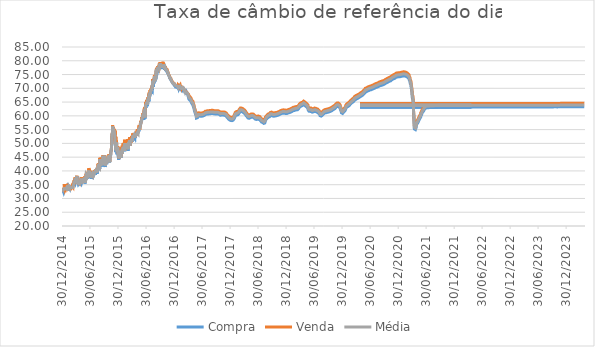
| Category | Compra | Venda | Média |
|---|---|---|---|
| 30/12/2014 | 33.41 | 33.81 | 33.61 |
| 31/12/2014 | 33.31 | 33.89 | 33.6 |
| 05/01/2015 | 33.19 | 33.45 | 33.32 |
| 06/01/2015 | 32.77 | 33.23 | 33 |
| 07/01/2015 | 32.99 | 33.15 | 33.07 |
| 08/01/2015 | 32.46 | 32.88 | 32.67 |
| 09/01/2015 | 32.31 | 33.02 | 32.67 |
| 12/01/2015 | 32.96 | 33.22 | 33.09 |
| 13/01/2015 | 33.39 | 33.78 | 33.59 |
| 14/01/2015 | 32.78 | 35.18 | 33.98 |
| 16/01/2015 | 33.11 | 33.54 | 33.33 |
| 19/01/2015 | 33.41 | 33.64 | 33.52 |
| 20/01/2015 | 33.86 | 34.04 | 33.95 |
| 21/01/2015 | 32.98 | 33.25 | 33.12 |
| 22/01/2015 | 33.01 | 33.4 | 33.21 |
| 23/01/2015 | 33.19 | 33.28 | 33.24 |
| 26/01/2015 | 33.58 | 33.79 | 33.69 |
| 27/01/2015 | 33.5 | 33.66 | 33.58 |
| 28/01/2015 | 33.8 | 34.09 | 33.94 |
| 29/01/2015 | 33.92 | 34.14 | 34.03 |
| 30/01/2015 | 34.05 | 34.41 | 34.23 |
| 02/02/2015 | 32.72 | 33.1 | 32.91 |
| 04/02/2015 | 34.33 | 35.3 | 34.82 |
| 05/02/2015 | 33.66 | 33.86 | 33.76 |
| 06/02/2015 | 33.56 | 34.07 | 33.82 |
| 09/02/2015 | 33.75 | 34.24 | 34 |
| 10/02/2015 | 34 | 34.16 | 34.08 |
| 11/02/2015 | 33.92 | 34.23 | 34.07 |
| 12/02/2015 | 33.47 | 34.16 | 33.82 |
| 13/02/2015 | 34.04 | 34.42 | 34.23 |
| 16/02/2015 | 34.07 | 34.35 | 34.21 |
| 17/02/2015 | 33.65 | 34.03 | 33.84 |
| 18/02/2015 | 34.13 | 34.38 | 34.26 |
| 19/02/2015 | 33.99 | 34.31 | 34.15 |
| 20/02/2015 | 33.86 | 34.08 | 33.97 |
| 23/02/2015 | 33.84 | 34.06 | 33.95 |
| 24/02/2015 | 33.92 | 34.16 | 34.04 |
| 25/02/2015 | 33.73 | 34.03 | 33.88 |
| 26/02/2015 | 33.79 | 34.07 | 33.93 |
| 27/02/2015 | 33.54 | 33.63 | 33.59 |
| 02/03/2015 | 33.59 | 33.95 | 33.77 |
| 03/03/2015 | 33.45 | 33.7 | 33.58 |
| 04/03/2015 | 33.99 | 34.03 | 34.01 |
| 05/03/2015 | 33.57 | 33.91 | 33.74 |
| 06/03/2015 | 34.19 | 34.52 | 34.36 |
| 09/03/2015 | 34.1 | 34.53 | 34.32 |
| 10/03/2015 | 33.95 | 34.41 | 34.18 |
| 11/03/2015 | 33.9 | 34.14 | 34.02 |
| 12/03/2015 | 34.52 | 34.81 | 34.66 |
| 13/03/2015 | 34.77 | 35.22 | 34.99 |
| 16/03/2015 | 34.54 | 35.8 | 35.17 |
| 17/03/2015 | 34.73 | 36 | 35.37 |
| 18/03/2015 | 35.22 | 35.74 | 35.48 |
| 19/03/2015 | 34.84 | 35.18 | 35.01 |
| 20/03/2015 | 36.2 | 36.65 | 36.43 |
| 23/03/2015 | 36.25 | 36.67 | 36.46 |
| 24/03/2015 | 35.73 | 35.77 | 35.75 |
| 25/03/2015 | 36.21 | 36.37 | 36.29 |
| 26/03/2015 | 37.08 | 37.64 | 37.36 |
| 27/03/2015 | 36.09 | 37.1 | 36.6 |
| 30/03/2015 | 36.76 | 36.85 | 36.81 |
| 31/03/2015 | 36.9 | 37.23 | 37.06 |
| 01/04/2015 | 36.66 | 37.42 | 37.04 |
| 02/04/2015 | 36.35 | 37.05 | 36.7 |
| 03/04/2015 | 36.42 | 37.27 | 36.85 |
| 06/04/2015 | 38.07 | 38.23 | 38.15 |
| 08/04/2015 | 35.6 | 36.64 | 36.12 |
| 09/04/2015 | 36.07 | 36.1 | 36.09 |
| 10/04/2015 | 35.89 | 36.43 | 36.16 |
| 13/04/2015 | 35.55 | 35.6 | 35.58 |
| 14/04/2015 | 35.37 | 35.87 | 35.62 |
| 15/04/2015 | 35.15 | 35.54 | 35.35 |
| 16/04/2015 | 34.99 | 35.49 | 35.24 |
| 17/04/2015 | 35.18 | 35.63 | 35.4 |
| 20/04/2015 | 35.32 | 35.33 | 35.32 |
| 21/04/2015 | 35.66 | 36.18 | 35.92 |
| 22/04/2015 | 35.44 | 35.83 | 35.64 |
| 23/04/2015 | 35.9 | 36.41 | 36.15 |
| 24/04/2015 | 34.79 | 35.5 | 35.14 |
| 27/04/2015 | 35.95 | 36.46 | 36.2 |
| 28/04/2015 | 35.36 | 36.19 | 35.78 |
| 29/04/2015 | 35.46 | 36.26 | 35.86 |
| 30/04/2015 | 36.15 | 36.94 | 36.55 |
| 04/05/2015 | 36.37 | 36.99 | 36.68 |
| 05/05/2015 | 35.52 | 37.62 | 36.57 |
| 06/05/2015 | 35.66 | 36.65 | 36.16 |
| 07/05/2015 | 35.65 | 36.28 | 35.97 |
| 08/05/2015 | 35.35 | 35.57 | 35.46 |
| 11/05/2015 | 36.71 | 37.3 | 37.01 |
| 12/05/2015 | 36.39 | 37.24 | 36.82 |
| 13/05/2015 | 36.15 | 36.72 | 36.44 |
| 14/05/2015 | 36.86 | 37.53 | 37.2 |
| 15/05/2015 | 35.96 | 36.35 | 36.15 |
| 18/05/2015 | 37.1 | 37.35 | 37.23 |
| 19/05/2015 | 37.07 | 37.46 | 37.27 |
| 20/05/2015 | 37.01 | 37.37 | 37.19 |
| 21/05/2015 | 37.07 | 37.58 | 37.33 |
| 22/05/2015 | 35.79 | 36.29 | 36.04 |
| 25/05/2015 | 37.26 | 37.88 | 37.57 |
| 26/05/2015 | 37.01 | 37.51 | 37.26 |
| 27/05/2015 | 36.24 | 36.68 | 36.46 |
| 28/05/2015 | 36.67 | 37.94 | 37.31 |
| 29/05/2015 | 35.45 | 35.78 | 35.62 |
| 01/06/2015 | 37.23 | 37.91 | 37.57 |
| 02/06/2015 | 37.41 | 38.12 | 37.77 |
| 03/06/2015 | 36.78 | 37.37 | 37.08 |
| 04/06/2015 | 37.12 | 37.56 | 37.34 |
| 05/06/2015 | 38.28 | 38.95 | 38.62 |
| 08/06/2015 | 37.31 | 39.33 | 38.32 |
| 09/06/2015 | 37.72 | 38.7 | 38.21 |
| 10/06/2015 | 38.78 | 39.02 | 38.9 |
| 11/06/2015 | 37.12 | 37.6 | 37.36 |
| 12/06/2015 | 38.28 | 38.99 | 38.64 |
| 15/06/2015 | 37.68 | 37.97 | 37.82 |
| 16/06/2015 | 37.86 | 38.35 | 38.11 |
| 17/06/2015 | 38.98 | 39.65 | 39.32 |
| 18/06/2015 | 38.48 | 39.15 | 38.82 |
| 19/06/2015 | 39.21 | 39.86 | 39.54 |
| 22/06/2015 | 39.32 | 40.93 | 40.12 |
| 23/06/2015 | 37.51 | 38.54 | 38.02 |
| 24/06/2015 | 38.88 | 40.06 | 39.47 |
| 26/06/2015 | 37.75 | 39.02 | 38.39 |
| 29/06/2015 | 37.6 | 38.69 | 38.15 |
| 30/06/2015 | 38.61 | 39.32 | 38.97 |
| 01/07/2015 | 38.78 | 39.81 | 39.3 |
| 02/07/2015 | 39.07 | 40.15 | 39.61 |
| 03/07/2015 | 38.58 | 39.61 | 39.1 |
| 06/07/2015 | 38.36 | 39.66 | 39.01 |
| 07/07/2015 | 38.48 | 39.03 | 38.76 |
| 08/07/2015 | 37.18 | 37.9 | 37.54 |
| 09/07/2015 | 38.58 | 39.07 | 38.83 |
| 10/07/2015 | 38.66 | 39.42 | 39.04 |
| 13/07/2015 | 38.29 | 39.21 | 38.75 |
| 14/07/2015 | 38.09 | 39.03 | 38.56 |
| 15/07/2015 | 37.99 | 38.83 | 38.41 |
| 16/07/2015 | 37.88 | 38.46 | 38.17 |
| 17/07/2015 | 38.49 | 39.11 | 38.8 |
| 20/07/2015 | 38.51 | 39.6 | 39.05 |
| 21/07/2015 | 38.02 | 38.59 | 38.3 |
| 22/07/2015 | 38.05 | 39.14 | 38.6 |
| 23/07/2015 | 38.37 | 38.81 | 38.59 |
| 24/07/2015 | 38.44 | 39.2 | 38.82 |
| 27/07/2015 | 38.34 | 39.09 | 38.72 |
| 28/07/2015 | 38.98 | 39.83 | 39.4 |
| 29/07/2015 | 38.8 | 39.92 | 39.36 |
| 30/07/2015 | 39.4 | 40.17 | 39.79 |
| 31/07/2015 | 38.93 | 39.61 | 39.27 |
| 03/08/2015 | 38.54 | 39.84 | 39.19 |
| 04/08/2015 | 39.4 | 40.1 | 39.75 |
| 05/08/2015 | 38.74 | 40 | 39.37 |
| 06/08/2015 | 39.09 | 39.58 | 39.34 |
| 07/08/2015 | 38.95 | 39.29 | 39.12 |
| 10/08/2015 | 40.2 | 40.58 | 40.39 |
| 11/08/2015 | 38.97 | 40.06 | 39.52 |
| 12/08/2015 | 39.74 | 40.74 | 40.24 |
| 13/08/2015 | 40.19 | 40.75 | 40.47 |
| 14/08/2015 | 39.02 | 40.12 | 39.57 |
| 17/08/2015 | 39.07 | 39.98 | 39.53 |
| 18/08/2015 | 39.68 | 40.12 | 39.9 |
| 19/08/2015 | 40.12 | 40.98 | 40.55 |
| 20/08/2015 | 40.54 | 41.3 | 40.92 |
| 21/08/2015 | 40.64 | 42.68 | 41.66 |
| 24/08/2015 | 41.15 | 42.15 | 41.65 |
| 25/08/2015 | 40.98 | 41.62 | 41.3 |
| 26/08/2015 | 42.32 | 42.7 | 42.51 |
| 27/08/2015 | 40.88 | 42.05 | 41.46 |
| 28/08/2015 | 41.23 | 41.53 | 41.38 |
| 31/08/2015 | 41.28 | 41.54 | 41.41 |
| 01/09/2015 | 40.97 | 41.2 | 41.09 |
| 02/09/2015 | 40.73 | 41.6 | 41.17 |
| 03/09/2015 | 43.92 | 44.74 | 44.33 |
| 04/09/2015 | 43.46 | 43.57 | 43.52 |
| 08/09/2015 | 42.87 | 42.9 | 42.89 |
| 09/09/2015 | 41.58 | 42.22 | 41.9 |
| 10/09/2015 | 43.62 | 43.87 | 43.74 |
| 11/09/2015 | 43.64 | 44.82 | 44.23 |
| 14/09/2015 | 42.45 | 42.7 | 42.57 |
| 15/09/2015 | 43.9 | 44.37 | 44.14 |
| 16/09/2015 | 43.67 | 44.1 | 43.89 |
| 17/09/2015 | 43.8 | 44.64 | 44.22 |
| 18/09/2015 | 42.71 | 42.83 | 42.77 |
| 21/09/2015 | 42.2 | 42.69 | 42.45 |
| 22/09/2015 | 41.99 | 42.59 | 42.29 |
| 23/09/2015 | 41.65 | 42.59 | 42.12 |
| 24/09/2015 | 45.22 | 45.73 | 45.48 |
| 28/09/2015 | 42.37 | 43.93 | 43.15 |
| 29/09/2015 | 41.91 | 42.58 | 42.25 |
| 30/09/2015 | 42.65 | 42.94 | 42.8 |
| 01/10/2015 | 42.83 | 43.13 | 42.98 |
| 02/10/2015 | 45.3 | 45.64 | 45.47 |
| 06/10/2015 | 44.32 | 45.07 | 44.7 |
| 07/10/2015 | 44.56 | 45.04 | 44.8 |
| 08/10/2015 | 41.39 | 42.49 | 41.94 |
| 09/10/2015 | 43.3 | 43.4 | 43.35 |
| 12/10/2015 | 42.78 | 43.4 | 43.09 |
| 13/10/2015 | 42.83 | 43.17 | 43 |
| 14/10/2015 | 42.52 | 43.03 | 42.78 |
| 15/10/2015 | 42.51 | 42.94 | 42.73 |
| 16/10/2015 | 42.92 | 43.3 | 43.11 |
| 19/10/2015 | 42.85 | 43.08 | 42.97 |
| 20/10/2015 | 43.11 | 43.65 | 43.38 |
| 21/10/2015 | 43.4 | 43.94 | 43.67 |
| 22/10/2015 | 44.31 | 44.73 | 44.52 |
| 23/10/2015 | 44.25 | 44.8 | 44.53 |
| 26/10/2015 | 43.49 | 43.72 | 43.61 |
| 27/10/2015 | 43.92 | 44.05 | 43.98 |
| 28/10/2015 | 45.02 | 45.74 | 45.38 |
| 29/10/2015 | 44.48 | 44.75 | 44.62 |
| 30/10/2015 | 44.95 | 45.1 | 45.03 |
| 02/11/2015 | 45.35 | 46.07 | 45.71 |
| 03/11/2015 | 44.11 | 44.13 | 44.12 |
| 04/11/2015 | 44.23 | 44.85 | 44.54 |
| 05/11/2015 | 43.08 | 43.22 | 43.15 |
| 06/11/2015 | 45.69 | 45.99 | 45.84 |
| 09/11/2015 | 44.98 | 45.04 | 45.01 |
| 11/11/2015 | 45.16 | 45.65 | 45.41 |
| 12/11/2015 | 45.76 | 45.78 | 45.77 |
| 13/11/2015 | 46.74 | 46.85 | 46.79 |
| 16/11/2015 | 47.68 | 47.8 | 47.74 |
| 17/11/2015 | 47.31 | 47.54 | 47.43 |
| 18/11/2015 | 49.04 | 49.64 | 49.34 |
| 19/11/2015 | 51.15 | 51.55 | 51.35 |
| 20/11/2015 | 53.06 | 53.13 | 53.1 |
| 23/11/2015 | 53.65 | 53.95 | 53.8 |
| 24/11/2015 | 55.76 | 56.57 | 56.16 |
| 25/11/2015 | 55.91 | 56.81 | 56.36 |
| 26/11/2015 | 55.15 | 56.02 | 55.59 |
| 27/11/2015 | 55.37 | 55.71 | 55.54 |
| 30/11/2015 | 55.9 | 55.91 | 55.91 |
| 01/12/2015 | 54.78 | 55.5 | 55.14 |
| 02/12/2015 | 53.61 | 53.71 | 53.66 |
| 03/12/2015 | 54.07 | 55.15 | 54.61 |
| 04/12/2015 | 53.48 | 54.8 | 54.14 |
| 07/12/2015 | 52.91 | 54.54 | 53.73 |
| 08/12/2015 | 53.37 | 54.21 | 53.79 |
| 09/12/2015 | 51.72 | 53.03 | 52.38 |
| 10/12/2015 | 50.76 | 54.64 | 52.7 |
| 11/12/2015 | 50.13 | 50.5 | 50.32 |
| 14/12/2015 | 48.13 | 48.96 | 48.55 |
| 15/12/2015 | 48.63 | 52.42 | 50.53 |
| 16/12/2015 | 46.82 | 48.19 | 47.51 |
| 17/12/2015 | 47.89 | 48.95 | 48.42 |
| 18/12/2015 | 49.3 | 50.99 | 50.15 |
| 21/12/2015 | 49.31 | 50.23 | 49.77 |
| 22/12/2015 | 47.58 | 48.96 | 48.27 |
| 23/12/2015 | 46 | 47.99 | 47 |
| 24/12/2015 | 45.86 | 47.47 | 46.66 |
| 28/12/2015 | 48.12 | 48.94 | 48.53 |
| 29/12/2015 | 46.67 | 48.29 | 47.48 |
| 30/12/2015 | 45.4 | 46.47 | 45.94 |
| 31/12/2015 | 45.13 | 46.67 | 45.9 |
| 04/01/2016 | 44.07 | 46.5 | 45.29 |
| 05/01/2016 | 44.84 | 45.78 | 45.31 |
| 06/01/2016 | 44.52 | 44.56 | 44.54 |
| 07/01/2016 | 45.32 | 48.33 | 46.83 |
| 08/01/2016 | 45.09 | 45.77 | 45.43 |
| 11/01/2016 | 46.09 | 48.52 | 47.31 |
| 12/01/2016 | 45.18 | 46.03 | 45.6 |
| 13/01/2016 | 45.61 | 46.3 | 45.96 |
| 14/01/2016 | 45.63 | 47.1 | 46.37 |
| 15/01/2016 | 45.66 | 47.88 | 46.77 |
| 18/01/2016 | 44.7 | 45.05 | 44.88 |
| 19/01/2016 | 45.3 | 46.12 | 45.71 |
| 20/01/2016 | 45.86 | 46.89 | 46.37 |
| 21/01/2016 | 46.28 | 46.95 | 46.62 |
| 22/01/2016 | 46.19 | 47.23 | 46.71 |
| 25/01/2016 | 46.43 | 48.39 | 47.41 |
| 26/01/2016 | 46.21 | 48.61 | 47.41 |
| 27/01/2016 | 46.92 | 49.11 | 48.02 |
| 28/01/2016 | 46.17 | 46.31 | 46.24 |
| 29/01/2016 | 47.33 | 47.97 | 47.65 |
| 01/02/2016 | 47.4 | 49.99 | 48.7 |
| 02/02/2016 | 47 | 48.53 | 47.77 |
| 04/02/2016 | 47.1 | 49.91 | 48.51 |
| 05/02/2016 | 48.09 | 49.41 | 48.75 |
| 08/02/2016 | 48.42 | 49.52 | 48.97 |
| 09/02/2016 | 48.08 | 50.11 | 49.1 |
| 10/02/2016 | 48.52 | 51.34 | 49.93 |
| 11/02/2016 | 47.11 | 47.37 | 47.24 |
| 12/02/2016 | 49.64 | 49.83 | 49.74 |
| 15/02/2016 | 47.9 | 50.11 | 49.01 |
| 16/02/2016 | 49.49 | 50.67 | 50.08 |
| 17/02/2016 | 47.98 | 50.68 | 49.33 |
| 18/02/2016 | 49.46 | 50.63 | 50.05 |
| 19/02/2016 | 48.13 | 48.87 | 48.5 |
| 22/02/2016 | 49.17 | 50.34 | 49.76 |
| 23/02/2016 | 48.43 | 49.27 | 48.85 |
| 24/02/2016 | 49.43 | 49.74 | 49.59 |
| 25/02/2016 | 47.79 | 48.09 | 47.94 |
| 26/02/2016 | 48.64 | 48.89 | 48.76 |
| 29/02/2016 | 47.87 | 49.51 | 48.69 |
| 01/03/2016 | 48.65 | 51.25 | 49.95 |
| 02/03/2016 | 49.7 | 50.74 | 50.22 |
| 03/03/2016 | 49 | 51.59 | 50.3 |
| 04/03/2016 | 47.29 | 48.51 | 47.9 |
| 07/03/2016 | 49.85 | 50.87 | 50.36 |
| 08/03/2016 | 49.86 | 51.19 | 50.53 |
| 09/03/2016 | 49.58 | 51.14 | 50.36 |
| 10/03/2016 | 49.3 | 49.81 | 49.55 |
| 11/03/2016 | 49.81 | 51.16 | 50.49 |
| 14/03/2016 | 50.06 | 52.1 | 51.08 |
| 15/03/2016 | 49.79 | 50.9 | 50.35 |
| 16/03/2016 | 49.03 | 49.03 | 49.03 |
| 17/03/2016 | 50.02 | 52.19 | 51.11 |
| 18/03/2016 | 50.33 | 50.58 | 50.46 |
| 21/03/2016 | 49.93 | 51.47 | 50.7 |
| 22/03/2016 | 50.19 | 50.22 | 50.21 |
| 23/03/2016 | 50.13 | 50.66 | 50.4 |
| 24/03/2016 | 50.7 | 50.74 | 50.72 |
| 28/03/2016 | 50.37 | 52.71 | 51.54 |
| 29/03/2016 | 51.29 | 52.17 | 51.73 |
| 30/03/2016 | 51.07 | 52.45 | 51.76 |
| 31/03/2016 | 50.69 | 51.07 | 50.88 |
| 01/04/2016 | 50.43 | 51.62 | 51.03 |
| 04/04/2016 | 51.32 | 53.62 | 52.47 |
| 05/04/2016 | 52.14 | 53.69 | 52.91 |
| 06/04/2016 | 51.1 | 53.42 | 52.26 |
| 08/04/2016 | 51.74 | 52.19 | 51.97 |
| 11/04/2016 | 52.43 | 53.24 | 52.84 |
| 12/04/2016 | 51.87 | 53.48 | 52.68 |
| 13/04/2016 | 51.9 | 52.04 | 51.97 |
| 14/04/2016 | 52.38 | 53.8 | 53.09 |
| 15/04/2016 | 52.39 | 53.51 | 52.95 |
| 18/04/2016 | 51.96 | 52.74 | 52.35 |
| 19/04/2016 | 52.69 | 53.64 | 53.17 |
| 20/04/2016 | 52.08 | 52.6 | 52.34 |
| 21/04/2016 | 52.88 | 53.64 | 53.26 |
| 22/04/2016 | 52.91 | 52.95 | 52.93 |
| 25/04/2016 | 53.14 | 53.64 | 53.39 |
| 26/04/2016 | 52.63 | 53.6 | 53.11 |
| 27/04/2016 | 53.15 | 53.65 | 53.4 |
| 28/04/2016 | 53.12 | 53.7 | 53.41 |
| 29/04/2016 | 53.12 | 54.15 | 53.64 |
| 03/05/2016 | 53.08 | 53.83 | 53.46 |
| 04/05/2016 | 52.86 | 55.12 | 53.99 |
| 05/05/2016 | 53.65 | 54.06 | 53.85 |
| 06/05/2016 | 53.9 | 54.36 | 54.13 |
| 09/05/2016 | 53.33 | 53.8 | 53.57 |
| 10/05/2016 | 54 | 54.6 | 54.3 |
| 11/05/2016 | 53.98 | 54.66 | 54.32 |
| 12/05/2016 | 54.21 | 54.48 | 54.35 |
| 13/05/2016 | 54.15 | 55.85 | 55 |
| 16/05/2016 | 54.66 | 56.63 | 55.65 |
| 17/05/2016 | 55.04 | 55.22 | 55.13 |
| 18/05/2016 | 55.19 | 55.65 | 55.42 |
| 19/05/2016 | 55.01 | 55.03 | 55.02 |
| 20/05/2016 | 55.63 | 55.73 | 55.68 |
| 23/05/2016 | 56.21 | 56.54 | 56.37 |
| 24/05/2016 | 56.77 | 57.91 | 57.34 |
| 25/05/2016 | 56.63 | 56.98 | 56.8 |
| 26/05/2016 | 57.15 | 57.87 | 57.51 |
| 27/05/2016 | 57.54 | 58.11 | 57.83 |
| 30/05/2016 | 57.62 | 58.06 | 57.84 |
| 31/05/2016 | 57.66 | 58.56 | 58.11 |
| 01/06/2016 | 58.15 | 59.5 | 58.83 |
| 02/06/2016 | 58.42 | 58.98 | 58.7 |
| 03/06/2016 | 58.95 | 59.21 | 59.08 |
| 06/06/2016 | 59.1 | 59.67 | 59.39 |
| 07/06/2016 | 58.7 | 59.59 | 59.15 |
| 08/06/2016 | 59.48 | 60.47 | 59.98 |
| 09/06/2016 | 59.6 | 59.72 | 59.66 |
| 10/06/2016 | 60.16 | 61 | 60.58 |
| 13/06/2016 | 59.9 | 60.22 | 60.06 |
| 14/06/2016 | 58.53 | 61.43 | 59.98 |
| 15/06/2016 | 61.1 | 61.12 | 61.11 |
| 16/06/2016 | 61.44 | 62.19 | 61.82 |
| 17/06/2016 | 61.29 | 61.98 | 61.64 |
| 20/06/2016 | 61.52 | 63.15 | 62.34 |
| 21/06/2016 | 61.97 | 62.35 | 62.16 |
| 22/06/2016 | 59.02 | 59.73 | 59.37 |
| 23/06/2016 | 61.86 | 62.38 | 62.12 |
| 24/06/2016 | 62.48 | 62.68 | 62.58 |
| 27/06/2016 | 63.54 | 64.16 | 63.85 |
| 28/06/2016 | 62.91 | 65.07 | 63.99 |
| 29/06/2016 | 63.22 | 64.09 | 63.65 |
| 30/06/2016 | 63.45 | 63.82 | 63.64 |
| 01/07/2016 | 63.42 | 63.93 | 63.68 |
| 04/07/2016 | 64.2 | 65.75 | 64.98 |
| 05/07/2016 | 64.44 | 64.68 | 64.56 |
| 06/07/2016 | 64.02 | 65.15 | 64.59 |
| 07/07/2016 | 64.61 | 65.52 | 65.07 |
| 08/07/2016 | 63.56 | 64.58 | 64.07 |
| 11/07/2016 | 64.77 | 65.75 | 65.26 |
| 12/07/2016 | 65.36 | 66.72 | 66.04 |
| 13/07/2016 | 65.3 | 65.66 | 65.48 |
| 14/07/2016 | 65.9 | 66.66 | 66.28 |
| 15/07/2016 | 65.79 | 66.44 | 66.12 |
| 18/07/2016 | 65.21 | 67.35 | 66.28 |
| 19/07/2016 | 66.12 | 68 | 67.06 |
| 20/07/2016 | 65.76 | 66.63 | 66.19 |
| 21/07/2016 | 67.62 | 68.44 | 68.03 |
| 22/07/2016 | 66.7 | 67.61 | 67.16 |
| 25/07/2016 | 67.61 | 68.23 | 67.92 |
| 26/07/2016 | 67.73 | 69.33 | 68.53 |
| 27/07/2016 | 67.8 | 68.52 | 68.16 |
| 28/07/2016 | 68.03 | 68.57 | 68.3 |
| 29/07/2016 | 68.52 | 68.9 | 68.71 |
| 01/08/2016 | 69.12 | 69.73 | 69.42 |
| 02/08/2016 | 68.9 | 69.34 | 69.12 |
| 03/08/2016 | 68.09 | 70.01 | 69.05 |
| 04/08/2016 | 68.88 | 69.36 | 69.12 |
| 05/08/2016 | 69.6 | 69.86 | 69.73 |
| 08/08/2016 | 69.27 | 70.69 | 69.98 |
| 09/08/2016 | 69.22 | 71.07 | 70.15 |
| 10/08/2016 | 70.45 | 71.38 | 70.92 |
| 11/08/2016 | 69.46 | 70.37 | 69.92 |
| 12/08/2016 | 72.14 | 73.35 | 72.74 |
| 15/08/2016 | 71.57 | 72.11 | 71.84 |
| 16/08/2016 | 70.48 | 72.56 | 71.52 |
| 17/08/2016 | 72.83 | 73.25 | 73.04 |
| 18/08/2016 | 72.84 | 73.33 | 73.09 |
| 19/08/2016 | 71.77 | 72.71 | 72.24 |
| 22/08/2016 | 72.39 | 73.76 | 73.08 |
| 23/08/2016 | 74.1 | 74.84 | 74.47 |
| 24/08/2016 | 72.46 | 73.09 | 72.78 |
| 25/08/2016 | 73.6 | 74.5 | 74.05 |
| 26/08/2016 | 73.04 | 74.88 | 73.96 |
| 29/08/2016 | 72.54 | 73.02 | 72.78 |
| 30/08/2016 | 73.07 | 74.24 | 73.65 |
| 31/08/2016 | 73.8 | 74.27 | 74.04 |
| 01/09/2016 | 73.24 | 74.01 | 73.63 |
| 02/09/2016 | 73.36 | 74.46 | 73.91 |
| 05/09/2016 | 76.52 | 77.1 | 76.81 |
| 06/09/2016 | 74.4 | 76.5 | 75.45 |
| 08/09/2016 | 76 | 76.79 | 76.4 |
| 09/09/2016 | 76.8 | 77.48 | 77.14 |
| 12/09/2016 | 76.77 | 77.36 | 77.07 |
| 13/09/2016 | 76.53 | 76.82 | 76.67 |
| 14/09/2016 | 77.27 | 77.99 | 77.63 |
| 15/09/2016 | 76.08 | 77.83 | 76.96 |
| 16/09/2016 | 76.9 | 76.95 | 76.92 |
| 19/09/2016 | 77.4 | 77.71 | 77.56 |
| 20/09/2016 | 77.45 | 77.49 | 77.47 |
| 21/09/2016 | 76.92 | 77.83 | 77.38 |
| 22/09/2016 | 77.14 | 77.58 | 77.36 |
| 23/09/2016 | 76.95 | 77.13 | 77.04 |
| 27/09/2016 | 77.61 | 78.12 | 77.87 |
| 28/09/2016 | 77.39 | 77.4 | 77.4 |
| 29/09/2016 | 77.61 | 78.57 | 78.09 |
| 30/09/2016 | 78.66 | 79.52 | 79.09 |
| 03/10/2016 | 77.29 | 77.7 | 77.5 |
| 05/10/2016 | 77.66 | 79.19 | 78.43 |
| 06/10/2016 | 77.64 | 78.59 | 78.12 |
| 07/10/2016 | 77.62 | 78.88 | 78.25 |
| 10/10/2016 | 77.32 | 78.1 | 77.71 |
| 11/10/2016 | 78.19 | 79.03 | 78.61 |
| 12/10/2016 | 77.07 | 78.88 | 77.98 |
| 13/10/2016 | 77.56 | 78.27 | 77.91 |
| 14/10/2016 | 77.93 | 78.24 | 78.09 |
| 17/10/2016 | 77.97 | 78.37 | 78.17 |
| 18/10/2016 | 77.01 | 79.6 | 78.31 |
| 19/10/2016 | 77.53 | 78.11 | 77.82 |
| 20/10/2016 | 78.22 | 79.03 | 78.63 |
| 21/10/2016 | 78.15 | 78.63 | 78.39 |
| 24/10/2016 | 77.89 | 78.42 | 78.16 |
| 25/10/2016 | 77.25 | 78.28 | 77.77 |
| 26/10/2016 | 77.19 | 78.61 | 77.9 |
| 27/10/2016 | 77.96 | 78.53 | 78.25 |
| 28/10/2016 | 76.79 | 77.52 | 77.15 |
| 31/10/2016 | 77.06 | 77.12 | 77.09 |
| 01/11/2016 | 77.23 | 78.02 | 77.62 |
| 02/11/2016 | 77.07 | 77.61 | 77.34 |
| 03/11/2016 | 76.86 | 77.5 | 77.18 |
| 04/11/2016 | 76.36 | 76.88 | 76.62 |
| 07/11/2016 | 76.94 | 77.43 | 77.19 |
| 08/11/2016 | 76.35 | 76.89 | 76.62 |
| 09/11/2016 | 76.63 | 77 | 76.82 |
| 11/11/2016 | 76.48 | 76.93 | 76.7 |
| 14/11/2016 | 76.22 | 76.95 | 76.59 |
| 15/11/2016 | 75.86 | 76.76 | 76.31 |
| 16/11/2016 | 75.82 | 76.48 | 76.15 |
| 17/11/2016 | 75.66 | 76.14 | 75.9 |
| 18/11/2016 | 75.4 | 75.98 | 75.69 |
| 21/11/2016 | 75.34 | 75.72 | 75.53 |
| 22/11/2016 | 75 | 75.34 | 75.17 |
| 23/11/2016 | 74.93 | 75.35 | 75.14 |
| 24/11/2016 | 74.73 | 75.09 | 74.91 |
| 25/11/2016 | 74.61 | 74.93 | 74.77 |
| 28/11/2016 | 74.19 | 74.99 | 74.59 |
| 29/11/2016 | 74.08 | 74.56 | 74.32 |
| 30/11/2016 | 73.72 | 74.06 | 73.89 |
| 01/12/2016 | 73.93 | 74.21 | 74.07 |
| 02/12/2016 | 73.41 | 74.06 | 73.74 |
| 05/12/2016 | 73.65 | 74 | 73.83 |
| 06/12/2016 | 73.44 | 73.92 | 73.68 |
| 07/12/2016 | 73.33 | 73.79 | 73.56 |
| 08/12/2016 | 73.15 | 73.72 | 73.44 |
| 09/12/2016 | 72.92 | 73.31 | 73.11 |
| 12/12/2016 | 72.66 | 73.07 | 72.86 |
| 13/12/2016 | 72.59 | 73.16 | 72.87 |
| 14/12/2016 | 72.62 | 73.05 | 72.84 |
| 15/12/2016 | 72.34 | 72.71 | 72.52 |
| 16/12/2016 | 72.15 | 72.69 | 72.42 |
| 19/12/2016 | 71.98 | 72.61 | 72.29 |
| 20/12/2016 | 71.92 | 72.68 | 72.3 |
| 21/12/2016 | 72.06 | 72.44 | 72.25 |
| 22/12/2016 | 71.58 | 72.05 | 71.81 |
| 23/12/2016 | 71.8 | 71.97 | 71.89 |
| 27/12/2016 | 71.49 | 72.11 | 71.8 |
| 28/12/2016 | 71.73 | 72.05 | 71.89 |
| 29/12/2016 | 71.55 | 71.87 | 71.71 |
| 30/12/2016 | 71.08 | 71.63 | 71.35 |
| 03/01/2017 | 70.89 | 71.58 | 71.24 |
| 04/01/2017 | 71.04 | 71.29 | 71.16 |
| 05/01/2017 | 71.06 | 71.33 | 71.2 |
| 06/01/2017 | 70.79 | 71.01 | 70.9 |
| 09/01/2017 | 70.9 | 71.31 | 71.11 |
| 10/01/2017 | 70.76 | 71.37 | 71.06 |
| 11/01/2017 | 70.56 | 71.06 | 70.81 |
| 12/01/2017 | 70.05 | 70.9 | 70.48 |
| 13/01/2017 | 70.69 | 71.08 | 70.89 |
| 16/01/2017 | 70.5 | 70.85 | 70.68 |
| 17/01/2017 | 70.56 | 71.12 | 70.84 |
| 18/01/2017 | 70.42 | 70.96 | 70.69 |
| 19/01/2017 | 70.28 | 71.38 | 70.83 |
| 20/01/2017 | 70.57 | 70.94 | 70.76 |
| 23/01/2017 | 70.32 | 70.6 | 70.46 |
| 24/01/2017 | 70.25 | 70.83 | 70.54 |
| 25/01/2017 | 69.93 | 70.57 | 70.25 |
| 26/01/2017 | 69.87 | 71.18 | 70.53 |
| 27/01/2017 | 69.98 | 71.25 | 70.62 |
| 30/01/2017 | 70.41 | 71.12 | 70.77 |
| 31/01/2017 | 69.92 | 71.35 | 70.64 |
| 01/02/2017 | 69.96 | 70.89 | 70.43 |
| 02/02/2017 | 70.13 | 70.79 | 70.46 |
| 06/02/2017 | 70.54 | 71.09 | 70.82 |
| 07/02/2017 | 70.34 | 71.2 | 70.77 |
| 08/02/2017 | 70.45 | 70.93 | 70.69 |
| 09/02/2017 | 70.36 | 70.72 | 70.54 |
| 10/02/2017 | 70.43 | 70.71 | 70.57 |
| 13/02/2017 | 69.74 | 70.25 | 70 |
| 14/02/2017 | 69.83 | 70.64 | 70.24 |
| 15/02/2017 | 70.12 | 70.41 | 70.27 |
| 16/02/2017 | 70.13 | 70.5 | 70.32 |
| 17/02/2017 | 70.25 | 70.48 | 70.36 |
| 20/02/2017 | 70.15 | 70.33 | 70.24 |
| 21/02/2017 | 69.57 | 70.36 | 69.97 |
| 22/02/2017 | 69.96 | 70.33 | 70.15 |
| 23/02/2017 | 69.68 | 70.01 | 69.85 |
| 24/02/2017 | 69.11 | 70.31 | 69.71 |
| 27/02/2017 | 69.56 | 70.03 | 69.8 |
| 28/02/2017 | 69.49 | 70 | 69.75 |
| 01/03/2017 | 69.45 | 69.91 | 69.68 |
| 02/03/2017 | 69.46 | 69.92 | 69.69 |
| 03/03/2017 | 69.24 | 69.78 | 69.51 |
| 06/03/2017 | 69.18 | 69.7 | 69.44 |
| 07/03/2017 | 68.6 | 69.43 | 69.02 |
| 08/03/2017 | 69.22 | 69.56 | 69.39 |
| 09/03/2017 | 69.14 | 69.41 | 69.28 |
| 10/03/2017 | 69.1 | 69.41 | 69.26 |
| 13/03/2017 | 68.71 | 69.14 | 68.93 |
| 14/03/2017 | 68.68 | 68.98 | 68.83 |
| 15/03/2017 | 68.69 | 68.96 | 68.83 |
| 16/03/2017 | 68.67 | 68.93 | 68.8 |
| 17/03/2017 | 68.41 | 68.79 | 68.6 |
| 20/03/2017 | 68.36 | 68.67 | 68.52 |
| 21/03/2017 | 68.33 | 68.62 | 68.47 |
| 22/03/2017 | 68.35 | 68.61 | 68.48 |
| 23/03/2017 | 67.7 | 68.9 | 68.3 |
| 24/03/2017 | 68.16 | 68.45 | 68.3 |
| 27/03/2017 | 67.95 | 68.44 | 68.2 |
| 28/03/2017 | 67.67 | 68.17 | 67.92 |
| 29/03/2017 | 67.96 | 68.12 | 68.04 |
| 30/03/2017 | 67.71 | 67.9 | 67.81 |
| 31/03/2017 | 67.79 | 67.87 | 67.83 |
| 03/04/2017 | 66.49 | 67.78 | 67.14 |
| 04/04/2017 | 66.35 | 67.61 | 66.99 |
| 05/04/2017 | 66.08 | 67.37 | 66.73 |
| 06/04/2017 | 66.04 | 67.3 | 66.67 |
| 10/04/2017 | 65.87 | 67.15 | 66.51 |
| 11/04/2017 | 65.79 | 67.08 | 66.44 |
| 12/04/2017 | 65.67 | 66.94 | 66.31 |
| 13/04/2017 | 65.65 | 66.89 | 66.27 |
| 17/04/2017 | 65.41 | 66.7 | 66.06 |
| 18/04/2017 | 65.26 | 66.51 | 65.88 |
| 19/04/2017 | 65.08 | 66.33 | 65.71 |
| 20/04/2017 | 65 | 66.21 | 65.61 |
| 21/04/2017 | 64.84 | 66.08 | 65.46 |
| 24/04/2017 | 64.61 | 65.88 | 65.24 |
| 25/04/2017 | 64.48 | 65.73 | 65.11 |
| 26/04/2017 | 64.3 | 65.53 | 64.91 |
| 27/04/2017 | 64.13 | 65.4 | 64.77 |
| 28/04/2017 | 64.05 | 65.28 | 64.67 |
| 02/05/2017 | 63.9 | 65.16 | 64.53 |
| 03/05/2017 | 63.58 | 64.82 | 64.2 |
| 04/05/2017 | 63.32 | 64.55 | 63.94 |
| 05/05/2017 | 63.01 | 64.21 | 63.61 |
| 08/05/2017 | 62.71 | 63.95 | 63.33 |
| 09/05/2017 | 62.45 | 63.66 | 63.06 |
| 10/05/2017 | 62.18 | 63.41 | 62.8 |
| 11/05/2017 | 61.9 | 63.1 | 62.5 |
| 12/05/2017 | 61.65 | 62.82 | 62.24 |
| 15/05/2017 | 61.3 | 62.52 | 61.91 |
| 16/05/2017 | 61.04 | 62.25 | 61.64 |
| 17/05/2017 | 60.81 | 62.01 | 61.41 |
| 18/05/2017 | 60.58 | 61.76 | 61.17 |
| 19/05/2017 | 60.34 | 61.5 | 60.92 |
| 22/05/2017 | 60.1 | 61.27 | 60.69 |
| 23/05/2017 | 59.63 | 60.8 | 60.22 |
| 24/05/2017 | 59.2 | 60.36 | 59.78 |
| 25/05/2017 | 58.99 | 60.17 | 59.58 |
| 26/05/2017 | 58.98 | 60.15 | 59.56 |
| 29/05/2017 | 59.05 | 60.21 | 59.63 |
| 30/05/2017 | 59.03 | 60.21 | 59.62 |
| 31/05/2017 | 59.34 | 60.48 | 59.91 |
| 01/06/2017 | 59.58 | 60.76 | 60.17 |
| 02/06/2017 | 59.73 | 60.91 | 60.32 |
| 05/06/2017 | 59.84 | 61.02 | 60.43 |
| 06/06/2017 | 60.02 | 61.19 | 60.61 |
| 07/06/2017 | 60.02 | 61.2 | 60.61 |
| 08/06/2017 | 59.97 | 61.15 | 60.56 |
| 09/06/2017 | 59.96 | 61.12 | 60.54 |
| 12/06/2017 | 59.92 | 61.1 | 60.51 |
| 13/06/2017 | 59.87 | 61.05 | 60.46 |
| 14/06/2017 | 59.86 | 61.02 | 60.44 |
| 15/06/2017 | 59.79 | 60.95 | 60.37 |
| 16/06/2017 | 59.83 | 60.97 | 60.4 |
| 19/06/2017 | 59.79 | 60.92 | 60.36 |
| 20/06/2017 | 59.82 | 60.99 | 60.41 |
| 21/06/2017 | 59.74 | 60.91 | 60.32 |
| 22/06/2017 | 59.82 | 61 | 60.41 |
| 23/06/2017 | 59.83 | 61.01 | 60.42 |
| 27/06/2017 | 59.85 | 61.01 | 60.43 |
| 28/06/2017 | 59.87 | 61.05 | 60.46 |
| 29/06/2017 | 59.85 | 61.04 | 60.45 |
| 30/06/2017 | 59.88 | 61.06 | 60.47 |
| 03/07/2017 | 59.87 | 61.06 | 60.47 |
| 04/07/2017 | 59.93 | 61.08 | 60.51 |
| 05/07/2017 | 59.97 | 61.13 | 60.55 |
| 06/07/2017 | 59.98 | 61.16 | 60.57 |
| 07/07/2017 | 59.98 | 61.17 | 60.58 |
| 10/07/2017 | 60.01 | 61.16 | 60.59 |
| 11/07/2017 | 60.04 | 61.21 | 60.63 |
| 12/07/2017 | 60.1 | 61.24 | 60.67 |
| 13/07/2017 | 60.14 | 61.3 | 60.72 |
| 14/07/2017 | 60.16 | 61.29 | 60.72 |
| 17/07/2017 | 60.17 | 61.33 | 60.75 |
| 18/07/2017 | 60.31 | 61.41 | 60.86 |
| 19/07/2017 | 60.33 | 61.51 | 60.92 |
| 20/07/2017 | 60.45 | 61.58 | 61.02 |
| 21/07/2017 | 60.53 | 61.67 | 61.1 |
| 24/07/2017 | 60.6 | 61.77 | 61.18 |
| 25/07/2017 | 60.59 | 61.76 | 61.17 |
| 26/07/2017 | 60.6 | 61.74 | 61.17 |
| 27/07/2017 | 60.57 | 61.75 | 61.16 |
| 28/07/2017 | 60.56 | 61.72 | 61.14 |
| 31/07/2017 | 60.57 | 61.75 | 61.16 |
| 01/08/2017 | 60.64 | 61.8 | 61.22 |
| 02/08/2017 | 60.66 | 61.85 | 61.25 |
| 03/08/2017 | 60.7 | 61.88 | 61.29 |
| 04/08/2017 | 60.7 | 61.87 | 61.29 |
| 07/08/2017 | 60.75 | 61.9 | 61.32 |
| 08/08/2017 | 60.69 | 61.88 | 61.28 |
| 09/08/2017 | 60.73 | 61.93 | 61.33 |
| 10/08/2017 | 60.68 | 61.85 | 61.27 |
| 11/08/2017 | 60.68 | 61.86 | 61.27 |
| 14/08/2017 | 60.71 | 61.87 | 61.29 |
| 15/08/2017 | 60.71 | 61.9 | 61.3 |
| 16/08/2017 | 60.72 | 61.9 | 61.31 |
| 17/08/2017 | 60.74 | 61.91 | 61.32 |
| 18/08/2017 | 60.74 | 61.93 | 61.34 |
| 21/08/2017 | 60.73 | 61.91 | 61.32 |
| 22/08/2017 | 60.79 | 61.92 | 61.36 |
| 23/08/2017 | 60.78 | 61.95 | 61.36 |
| 24/08/2017 | 60.81 | 61.97 | 61.39 |
| 25/08/2017 | 60.79 | 61.96 | 61.37 |
| 28/08/2017 | 60.78 | 61.98 | 61.38 |
| 29/08/2017 | 60.81 | 61.99 | 61.4 |
| 30/08/2017 | 60.83 | 62 | 61.41 |
| 31/08/2017 | 60.83 | 62.02 | 61.43 |
| 01/09/2017 | 60.85 | 62.03 | 61.44 |
| 04/09/2017 | 60.86 | 62.03 | 61.45 |
| 05/09/2017 | 60.86 | 62.03 | 61.45 |
| 06/09/2017 | 60.83 | 62 | 61.41 |
| 08/09/2017 | 60.84 | 62.01 | 61.43 |
| 11/09/2017 | 60.85 | 62 | 61.43 |
| 12/09/2017 | 60.83 | 61.98 | 61.41 |
| 13/09/2017 | 60.77 | 61.93 | 61.35 |
| 14/09/2017 | 60.74 | 61.89 | 61.31 |
| 15/09/2017 | 60.73 | 61.9 | 61.31 |
| 18/09/2017 | 60.73 | 61.9 | 61.31 |
| 19/09/2017 | 60.72 | 61.89 | 61.3 |
| 20/09/2017 | 60.73 | 61.89 | 61.31 |
| 21/09/2017 | 60.72 | 61.88 | 61.3 |
| 22/09/2017 | 60.7 | 61.85 | 61.27 |
| 26/09/2017 | 60.7 | 61.85 | 61.28 |
| 27/09/2017 | 60.71 | 61.88 | 61.3 |
| 28/09/2017 | 60.7 | 61.87 | 61.28 |
| 29/09/2017 | 60.7 | 61.87 | 61.28 |
| 02/10/2017 | 60.7 | 61.86 | 61.28 |
| 03/10/2017 | 60.67 | 61.86 | 61.27 |
| 05/10/2017 | 60.68 | 61.84 | 61.26 |
| 06/10/2017 | 60.71 | 61.86 | 61.28 |
| 09/10/2017 | 60.7 | 61.85 | 61.28 |
| 10/10/2017 | 60.7 | 61.84 | 61.27 |
| 11/10/2017 | 60.67 | 61.83 | 61.25 |
| 12/10/2017 | 60.71 | 61.86 | 61.28 |
| 13/10/2017 | 60.71 | 61.84 | 61.27 |
| 16/10/2017 | 60.69 | 61.8 | 61.25 |
| 17/10/2017 | 60.65 | 61.78 | 61.21 |
| 18/10/2017 | 60.63 | 61.77 | 61.2 |
| 19/10/2017 | 60.53 | 61.68 | 61.11 |
| 20/10/2017 | 60.5 | 61.65 | 61.08 |
| 23/10/2017 | 60.46 | 61.6 | 61.03 |
| 24/10/2017 | 60.42 | 61.57 | 60.99 |
| 25/10/2017 | 60.31 | 61.41 | 60.86 |
| 26/10/2017 | 60.23 | 61.35 | 60.79 |
| 27/10/2017 | 60.21 | 61.33 | 60.77 |
| 30/10/2017 | 60.2 | 61.34 | 60.77 |
| 31/10/2017 | 60.2 | 61.32 | 60.76 |
| 01/11/2017 | 60.2 | 61.34 | 60.77 |
| 02/11/2017 | 60.26 | 61.37 | 60.82 |
| 03/11/2017 | 60.29 | 61.43 | 60.86 |
| 06/11/2017 | 60.32 | 61.46 | 60.89 |
| 07/11/2017 | 60.32 | 61.47 | 60.9 |
| 08/11/2017 | 60.29 | 61.44 | 60.87 |
| 09/11/2017 | 60.3 | 61.44 | 60.87 |
| 13/11/2017 | 60.28 | 61.4 | 60.84 |
| 14/11/2017 | 60.22 | 61.37 | 60.8 |
| 15/11/2017 | 60.22 | 61.35 | 60.78 |
| 16/11/2017 | 60.21 | 61.37 | 60.79 |
| 17/11/2017 | 60.23 | 61.35 | 60.79 |
| 20/11/2017 | 60.25 | 61.39 | 60.82 |
| 21/11/2017 | 60.24 | 61.41 | 60.83 |
| 22/11/2017 | 60.26 | 61.4 | 60.83 |
| 23/11/2017 | 60.24 | 61.39 | 60.81 |
| 24/11/2017 | 60.18 | 61.35 | 60.77 |
| 27/11/2017 | 60.13 | 61.29 | 60.71 |
| 28/11/2017 | 60.1 | 61.26 | 60.68 |
| 29/11/2017 | 60.09 | 61.24 | 60.67 |
| 30/11/2017 | 60.07 | 61.2 | 60.63 |
| 01/12/2017 | 60.04 | 61.2 | 60.62 |
| 04/12/2017 | 59.96 | 61.08 | 60.52 |
| 05/12/2017 | 59.84 | 60.98 | 60.41 |
| 06/12/2017 | 59.72 | 60.87 | 60.3 |
| 07/12/2017 | 59.65 | 60.8 | 60.23 |
| 08/12/2017 | 59.55 | 60.7 | 60.13 |
| 11/12/2017 | 59.44 | 60.6 | 60.02 |
| 12/12/2017 | 59.36 | 60.5 | 59.93 |
| 13/12/2017 | 59.28 | 60.43 | 59.86 |
| 14/12/2017 | 59.2 | 60.36 | 59.78 |
| 15/12/2017 | 59.14 | 60.28 | 59.7 |
| 18/12/2017 | 59.01 | 60.15 | 59.58 |
| 19/12/2017 | 58.93 | 60.07 | 59.5 |
| 20/12/2017 | 58.85 | 59.99 | 59.42 |
| 21/12/2017 | 58.77 | 59.88 | 59.33 |
| 22/12/2017 | 58.63 | 59.77 | 59.2 |
| 26/12/2017 | 58.55 | 59.71 | 59.13 |
| 27/12/2017 | 58.47 | 59.62 | 59.05 |
| 28/12/2017 | 58.45 | 59.61 | 59.03 |
| 29/12/2017 | 58.44 | 59.6 | 59.02 |
| 02/01/2018 | 58.4 | 59.56 | 58.98 |
| 03/01/2018 | 58.36 | 59.52 | 58.94 |
| 04/01/2018 | 58.31 | 59.47 | 58.89 |
| 05/01/2018 | 58.34 | 59.45 | 58.9 |
| 08/01/2018 | 58.3 | 59.44 | 58.87 |
| 09/01/2018 | 58.29 | 59.45 | 58.87 |
| 10/01/2018 | 58.29 | 59.43 | 58.86 |
| 11/01/2018 | 58.26 | 59.41 | 58.83 |
| 12/01/2018 | 58.28 | 59.44 | 58.86 |
| 15/01/2018 | 58.32 | 59.44 | 58.88 |
| 16/01/2018 | 58.34 | 59.5 | 58.92 |
| 17/01/2018 | 58.38 | 59.54 | 58.96 |
| 18/01/2018 | 58.44 | 59.59 | 59.01 |
| 19/01/2018 | 58.51 | 59.68 | 59.09 |
| 22/01/2018 | 58.64 | 59.81 | 59.22 |
| 23/01/2018 | 58.78 | 59.93 | 59.35 |
| 24/01/2018 | 58.88 | 60.05 | 59.47 |
| 25/01/2018 | 59.05 | 60.22 | 59.64 |
| 26/01/2018 | 59.24 | 60.43 | 59.84 |
| 29/01/2018 | 59.42 | 60.6 | 60.01 |
| 30/01/2018 | 59.61 | 60.8 | 60.21 |
| 31/01/2018 | 59.85 | 61.02 | 60.44 |
| 01/02/2018 | 60.06 | 61.22 | 60.64 |
| 02/02/2018 | 60.19 | 61.39 | 60.79 |
| 05/02/2018 | 60.24 | 61.44 | 60.84 |
| 06/02/2018 | 60.3 | 61.5 | 60.9 |
| 07/02/2018 | 60.36 | 61.56 | 60.96 |
| 08/02/2018 | 60.33 | 61.54 | 60.94 |
| 09/02/2018 | 60.3 | 61.49 | 60.89 |
| 12/02/2018 | 60.29 | 61.5 | 60.89 |
| 13/02/2018 | 60.32 | 61.53 | 60.92 |
| 14/02/2018 | 60.33 | 61.52 | 60.93 |
| 15/02/2018 | 60.35 | 61.55 | 60.95 |
| 16/02/2018 | 60.37 | 61.57 | 60.97 |
| 19/02/2018 | 60.41 | 61.62 | 61.02 |
| 20/02/2018 | 60.48 | 61.69 | 61.09 |
| 21/02/2018 | 60.54 | 61.73 | 61.14 |
| 22/02/2018 | 60.63 | 61.84 | 61.23 |
| 23/02/2018 | 60.73 | 61.94 | 61.34 |
| 26/02/2018 | 60.94 | 62.15 | 61.55 |
| 27/02/2018 | 61.1 | 62.32 | 61.71 |
| 28/02/2018 | 61.17 | 62.39 | 61.78 |
| 01/03/2018 | 61.26 | 62.48 | 61.87 |
| 02/03/2018 | 61.35 | 62.58 | 61.97 |
| 05/03/2018 | 61.41 | 62.64 | 62.03 |
| 06/03/2018 | 61.58 | 62.81 | 62.19 |
| 07/03/2018 | 61.61 | 62.84 | 62.23 |
| 08/03/2018 | 61.62 | 62.81 | 62.21 |
| 09/03/2018 | 61.6 | 62.81 | 62.2 |
| 12/03/2018 | 61.57 | 62.76 | 62.17 |
| 13/03/2018 | 61.6 | 62.81 | 62.2 |
| 14/03/2018 | 61.61 | 62.82 | 62.22 |
| 15/03/2018 | 61.6 | 62.82 | 62.21 |
| 16/03/2018 | 61.55 | 62.77 | 62.16 |
| 19/03/2018 | 61.51 | 62.73 | 62.12 |
| 20/03/2018 | 61.47 | 62.69 | 62.08 |
| 21/03/2018 | 61.43 | 62.65 | 62.04 |
| 22/03/2018 | 61.38 | 62.6 | 61.99 |
| 23/03/2018 | 61.34 | 62.56 | 61.95 |
| 26/03/2018 | 61.31 | 62.51 | 61.91 |
| 27/03/2018 | 61.2 | 62.42 | 61.81 |
| 28/03/2018 | 61.09 | 62.3 | 61.7 |
| 29/03/2018 | 61.03 | 62.22 | 61.62 |
| 02/04/2018 | 60.93 | 62.12 | 61.53 |
| 03/04/2018 | 60.9 | 62.08 | 61.49 |
| 04/04/2018 | 60.83 | 62.03 | 61.43 |
| 05/04/2018 | 60.72 | 61.9 | 61.31 |
| 06/04/2018 | 60.6 | 61.78 | 61.19 |
| 09/04/2018 | 60.48 | 61.68 | 61.08 |
| 10/04/2018 | 60.37 | 61.57 | 60.97 |
| 11/04/2018 | 60.26 | 61.45 | 60.85 |
| 12/04/2018 | 60.14 | 61.34 | 60.74 |
| 13/04/2018 | 60.06 | 61.25 | 60.65 |
| 16/04/2018 | 60.01 | 61.2 | 60.61 |
| 17/04/2018 | 59.97 | 61.16 | 60.56 |
| 18/04/2018 | 59.89 | 61.08 | 60.48 |
| 19/04/2018 | 59.76 | 60.95 | 60.36 |
| 20/04/2018 | 59.64 | 60.82 | 60.23 |
| 23/04/2018 | 59.5 | 60.68 | 60.09 |
| 24/04/2018 | 59.35 | 60.53 | 59.94 |
| 25/04/2018 | 59.23 | 60.41 | 59.82 |
| 26/04/2018 | 59.19 | 60.36 | 59.78 |
| 27/04/2018 | 59.11 | 60.28 | 59.69 |
| 30/04/2018 | 59.1 | 60.27 | 59.69 |
| 02/05/2018 | 59.1 | 60.27 | 59.69 |
| 03/05/2018 | 59.13 | 60.28 | 59.71 |
| 04/05/2018 | 59.15 | 60.32 | 59.74 |
| 07/05/2018 | 59.21 | 60.34 | 59.77 |
| 08/05/2018 | 59.25 | 60.39 | 59.82 |
| 09/05/2018 | 59.3 | 60.46 | 59.89 |
| 10/05/2018 | 59.37 | 60.53 | 59.95 |
| 11/05/2018 | 59.48 | 60.58 | 60.03 |
| 14/05/2018 | 59.48 | 60.64 | 60.06 |
| 15/05/2018 | 59.53 | 60.68 | 60.11 |
| 16/05/2018 | 59.52 | 60.71 | 60.11 |
| 17/05/2018 | 59.54 | 60.72 | 60.13 |
| 18/05/2018 | 59.53 | 60.71 | 60.12 |
| 21/05/2018 | 59.57 | 60.71 | 60.14 |
| 22/05/2018 | 59.54 | 60.7 | 60.12 |
| 23/05/2018 | 59.54 | 60.7 | 60.12 |
| 24/05/2018 | 59.55 | 60.7 | 60.12 |
| 25/05/2018 | 59.55 | 60.7 | 60.12 |
| 28/05/2018 | 59.53 | 60.7 | 60.12 |
| 29/05/2018 | 59.51 | 60.68 | 60.09 |
| 30/05/2018 | 59.47 | 60.62 | 60.04 |
| 31/05/2018 | 59.38 | 60.53 | 59.96 |
| 01/06/2018 | 59.32 | 60.46 | 59.89 |
| 04/06/2018 | 59.27 | 60.41 | 59.84 |
| 05/06/2018 | 59.2 | 60.35 | 59.78 |
| 06/06/2018 | 59.11 | 60.26 | 59.68 |
| 07/06/2018 | 59 | 60.16 | 59.58 |
| 08/06/2018 | 58.89 | 60.06 | 59.48 |
| 11/06/2018 | 58.86 | 59.98 | 59.41 |
| 12/06/2018 | 58.76 | 59.93 | 59.34 |
| 13/06/2018 | 58.74 | 59.9 | 59.32 |
| 14/06/2018 | 58.73 | 59.9 | 59.32 |
| 15/06/2018 | 58.74 | 59.91 | 59.33 |
| 18/06/2018 | 58.74 | 59.89 | 59.32 |
| 19/06/2018 | 58.72 | 59.88 | 59.3 |
| 20/06/2018 | 58.71 | 59.87 | 59.29 |
| 21/06/2018 | 58.71 | 59.88 | 59.3 |
| 22/06/2018 | 58.73 | 59.89 | 59.31 |
| 26/06/2018 | 58.74 | 59.88 | 59.31 |
| 27/06/2018 | 58.74 | 59.9 | 59.32 |
| 28/06/2018 | 58.74 | 59.9 | 59.32 |
| 29/06/2018 | 58.74 | 59.9 | 59.32 |
| 02/07/2018 | 58.75 | 59.91 | 59.33 |
| 03/07/2018 | 58.75 | 59.92 | 59.33 |
| 04/07/2018 | 58.76 | 59.9 | 59.33 |
| 05/07/2018 | 58.73 | 59.89 | 59.31 |
| 06/07/2018 | 58.7 | 59.86 | 59.28 |
| 09/07/2018 | 58.67 | 59.82 | 59.25 |
| 10/07/2018 | 58.62 | 59.79 | 59.2 |
| 11/07/2018 | 58.58 | 59.74 | 59.16 |
| 12/07/2018 | 58.52 | 59.68 | 59.1 |
| 13/07/2018 | 58.41 | 59.57 | 58.99 |
| 16/07/2018 | 58.32 | 59.44 | 58.88 |
| 17/07/2018 | 58.22 | 59.38 | 58.8 |
| 18/07/2018 | 58.11 | 59.26 | 58.68 |
| 19/07/2018 | 57.94 | 59.09 | 58.52 |
| 20/07/2018 | 57.83 | 58.98 | 58.41 |
| 23/07/2018 | 57.74 | 58.89 | 58.32 |
| 24/07/2018 | 57.68 | 58.83 | 58.26 |
| 25/07/2018 | 57.64 | 58.79 | 58.22 |
| 26/07/2018 | 57.64 | 58.79 | 58.21 |
| 27/07/2018 | 57.62 | 58.77 | 58.19 |
| 30/07/2018 | 57.61 | 58.75 | 58.18 |
| 31/07/2018 | 57.57 | 58.72 | 58.15 |
| 01/08/2018 | 57.5 | 58.64 | 58.07 |
| 02/08/2018 | 57.41 | 58.55 | 57.98 |
| 03/08/2018 | 57.32 | 58.46 | 57.89 |
| 06/08/2018 | 57.27 | 58.42 | 57.85 |
| 07/08/2018 | 57.25 | 58.39 | 57.82 |
| 08/08/2018 | 57.26 | 58.4 | 57.83 |
| 09/08/2018 | 57.28 | 58.43 | 57.86 |
| 10/08/2018 | 57.35 | 58.49 | 57.92 |
| 13/08/2018 | 57.42 | 58.57 | 58 |
| 14/08/2018 | 57.59 | 58.74 | 58.17 |
| 15/08/2018 | 57.79 | 58.94 | 58.36 |
| 16/08/2018 | 58.11 | 59.27 | 58.69 |
| 17/08/2018 | 58.38 | 59.55 | 58.97 |
| 20/08/2018 | 58.5 | 59.66 | 59.08 |
| 21/08/2018 | 58.59 | 59.76 | 59.17 |
| 22/08/2018 | 58.71 | 59.88 | 59.29 |
| 23/08/2018 | 58.82 | 59.99 | 59.41 |
| 24/08/2018 | 58.91 | 60.08 | 59.49 |
| 27/08/2018 | 58.99 | 60.16 | 59.57 |
| 28/08/2018 | 59.09 | 60.26 | 59.68 |
| 29/08/2018 | 59.19 | 60.38 | 59.79 |
| 30/08/2018 | 59.29 | 60.47 | 59.88 |
| 31/08/2018 | 59.34 | 60.52 | 59.93 |
| 03/09/2018 | 59.44 | 60.63 | 60.03 |
| 04/09/2018 | 59.48 | 60.67 | 60.08 |
| 05/09/2018 | 59.54 | 60.7 | 60.12 |
| 06/09/2018 | 59.62 | 60.81 | 60.22 |
| 10/09/2018 | 59.63 | 60.82 | 60.23 |
| 11/09/2018 | 59.62 | 60.81 | 60.21 |
| 12/09/2018 | 59.65 | 60.84 | 60.25 |
| 13/09/2018 | 59.69 | 60.88 | 60.29 |
| 14/09/2018 | 59.77 | 60.95 | 60.36 |
| 17/09/2018 | 59.92 | 61.12 | 60.52 |
| 18/09/2018 | 60.02 | 61.22 | 60.62 |
| 19/09/2018 | 60.16 | 61.36 | 60.76 |
| 20/09/2018 | 60.29 | 61.48 | 60.88 |
| 21/09/2018 | 60.31 | 61.52 | 60.92 |
| 24/09/2018 | 60.22 | 61.42 | 60.82 |
| 26/09/2018 | 60.15 | 61.35 | 60.75 |
| 27/09/2018 | 60.11 | 61.31 | 60.71 |
| 28/09/2018 | 60.04 | 61.24 | 60.64 |
| 01/10/2018 | 60.01 | 61.2 | 60.61 |
| 02/10/2018 | 59.97 | 61.17 | 60.57 |
| 03/10/2018 | 59.93 | 61.13 | 60.53 |
| 05/10/2018 | 59.89 | 61.09 | 60.49 |
| 08/10/2018 | 59.88 | 61.08 | 60.48 |
| 09/10/2018 | 59.88 | 61.07 | 60.47 |
| 11/10/2018 | 59.87 | 61.07 | 60.47 |
| 12/10/2018 | 59.9 | 61.1 | 60.5 |
| 15/10/2018 | 59.92 | 61.12 | 60.52 |
| 16/10/2018 | 59.93 | 61.12 | 60.53 |
| 17/10/2018 | 59.96 | 61.14 | 60.55 |
| 18/10/2018 | 59.95 | 61.14 | 60.55 |
| 19/10/2018 | 59.98 | 61.16 | 60.57 |
| 22/10/2018 | 59.98 | 61.17 | 60.57 |
| 23/10/2018 | 59.98 | 61.15 | 60.56 |
| 24/10/2018 | 60.01 | 61.19 | 60.6 |
| 25/10/2018 | 60.01 | 61.2 | 60.61 |
| 26/10/2018 | 60.01 | 61.2 | 60.61 |
| 29/10/2018 | 60.02 | 61.21 | 60.62 |
| 30/10/2018 | 60.03 | 61.18 | 60.6 |
| 31/10/2018 | 60.06 | 61.25 | 60.65 |
| 01/11/2018 | 60.1 | 61.28 | 60.69 |
| 02/11/2018 | 60.14 | 61.33 | 60.74 |
| 05/11/2018 | 60.16 | 61.35 | 60.76 |
| 06/11/2018 | 60.21 | 61.4 | 60.81 |
| 07/11/2018 | 60.25 | 61.42 | 60.84 |
| 08/11/2018 | 60.26 | 61.45 | 60.85 |
| 09/11/2018 | 60.28 | 61.47 | 60.88 |
| 12/11/2018 | 60.3 | 61.49 | 60.89 |
| 13/11/2018 | 60.32 | 61.51 | 60.91 |
| 14/11/2018 | 60.39 | 61.58 | 60.99 |
| 15/11/2018 | 60.42 | 61.6 | 61.01 |
| 16/11/2018 | 60.45 | 61.64 | 61.04 |
| 19/11/2018 | 60.52 | 61.73 | 61.13 |
| 20/11/2018 | 60.62 | 61.8 | 61.21 |
| 21/11/2018 | 60.65 | 61.84 | 61.25 |
| 22/11/2018 | 60.66 | 61.86 | 61.26 |
| 23/11/2018 | 60.67 | 61.86 | 61.27 |
| 26/11/2018 | 60.68 | 61.88 | 61.28 |
| 27/11/2018 | 60.71 | 61.91 | 61.31 |
| 28/11/2018 | 60.75 | 61.95 | 61.35 |
| 29/11/2018 | 60.8 | 62 | 61.4 |
| 30/11/2018 | 60.86 | 62.07 | 61.47 |
| 03/12/2018 | 60.9 | 62.09 | 61.49 |
| 04/12/2018 | 60.91 | 62.12 | 61.52 |
| 05/12/2018 | 60.93 | 62.14 | 61.54 |
| 06/12/2018 | 60.96 | 62.14 | 61.55 |
| 07/12/2018 | 60.98 | 62.17 | 61.58 |
| 10/12/2018 | 60.97 | 62.15 | 61.56 |
| 11/12/2018 | 60.96 | 62.17 | 61.57 |
| 12/12/2018 | 60.96 | 62.17 | 61.57 |
| 13/12/2018 | 60.97 | 62.18 | 61.57 |
| 14/12/2018 | 60.96 | 62.17 | 61.57 |
| 17/12/2018 | 60.95 | 62.16 | 61.56 |
| 18/12/2018 | 60.95 | 62.16 | 61.55 |
| 19/12/2018 | 60.95 | 62.16 | 61.56 |
| 20/12/2018 | 60.93 | 62.13 | 61.53 |
| 21/12/2018 | 60.91 | 62.09 | 61.5 |
| 24/12/2018 | 60.91 | 62.13 | 61.52 |
| 26/12/2018 | 60.88 | 62.09 | 61.48 |
| 27/12/2018 | 60.86 | 62.07 | 61.46 |
| 28/12/2018 | 60.86 | 62.06 | 61.46 |
| 31/12/2018 | 60.86 | 62.07 | 61.47 |
| 02/01/2019 | 60.85 | 62.06 | 61.46 |
| 03/01/2019 | 60.84 | 62.05 | 61.45 |
| 04/01/2019 | 60.88 | 62.09 | 61.49 |
| 07/01/2019 | 60.89 | 62.1 | 61.5 |
| 08/01/2019 | 60.93 | 62.14 | 61.53 |
| 09/01/2019 | 60.96 | 62.17 | 61.56 |
| 10/01/2019 | 60.99 | 62.2 | 61.59 |
| 11/01/2019 | 61.02 | 62.23 | 61.63 |
| 14/01/2019 | 61.05 | 62.26 | 61.66 |
| 15/01/2019 | 61.08 | 62.29 | 61.68 |
| 16/01/2019 | 61.12 | 62.33 | 61.72 |
| 17/01/2019 | 61.14 | 62.35 | 61.74 |
| 18/01/2019 | 61.17 | 62.39 | 61.78 |
| 21/01/2019 | 61.19 | 62.4 | 61.8 |
| 22/01/2019 | 61.23 | 62.38 | 61.8 |
| 23/01/2019 | 61.23 | 62.44 | 61.84 |
| 24/01/2019 | 61.26 | 62.47 | 61.86 |
| 25/01/2019 | 61.29 | 62.51 | 61.9 |
| 28/01/2019 | 61.31 | 62.52 | 61.92 |
| 29/01/2019 | 61.34 | 62.55 | 61.95 |
| 30/01/2019 | 61.37 | 62.59 | 61.98 |
| 31/01/2019 | 61.42 | 62.64 | 62.03 |
| 01/02/2019 | 61.44 | 62.67 | 62.06 |
| 05/02/2019 | 61.49 | 62.72 | 62.1 |
| 06/02/2019 | 61.56 | 62.78 | 62.17 |
| 07/02/2019 | 61.64 | 62.86 | 62.25 |
| 08/02/2019 | 61.68 | 62.91 | 62.3 |
| 11/02/2019 | 61.72 | 62.95 | 62.34 |
| 12/02/2019 | 61.76 | 62.98 | 62.37 |
| 13/02/2019 | 61.81 | 63.04 | 62.43 |
| 14/02/2019 | 61.86 | 63.09 | 62.47 |
| 15/02/2019 | 61.9 | 63.13 | 62.51 |
| 18/02/2019 | 61.93 | 63.16 | 62.54 |
| 19/02/2019 | 61.94 | 63.17 | 62.55 |
| 20/02/2019 | 61.94 | 63.17 | 62.56 |
| 21/02/2019 | 61.94 | 63.17 | 62.55 |
| 22/02/2019 | 61.93 | 63.16 | 62.55 |
| 25/02/2019 | 61.94 | 63.17 | 62.56 |
| 26/02/2019 | 61.98 | 63.21 | 62.6 |
| 27/02/2019 | 62.03 | 63.26 | 62.65 |
| 28/02/2019 | 62.08 | 63.31 | 62.69 |
| 01/03/2019 | 62.09 | 63.32 | 62.71 |
| 04/03/2019 | 62.11 | 63.34 | 62.72 |
| 05/03/2019 | 62.12 | 63.35 | 62.74 |
| 06/03/2019 | 62.14 | 63.37 | 62.75 |
| 07/03/2019 | 62.17 | 63.39 | 62.78 |
| 08/03/2019 | 62.17 | 63.4 | 62.78 |
| 11/03/2019 | 62.17 | 63.39 | 62.78 |
| 12/03/2019 | 62.17 | 63.39 | 62.78 |
| 13/03/2019 | 62.18 | 63.4 | 62.79 |
| 14/03/2019 | 62.2 | 63.42 | 62.81 |
| 15/03/2019 | 62.23 | 63.44 | 62.84 |
| 18/03/2019 | 62.28 | 63.48 | 62.88 |
| 19/03/2019 | 62.36 | 63.57 | 62.97 |
| 20/03/2019 | 62.5 | 63.7 | 63.1 |
| 21/03/2019 | 62.62 | 63.83 | 63.23 |
| 22/03/2019 | 62.79 | 63.98 | 63.39 |
| 25/03/2019 | 62.91 | 64.09 | 63.5 |
| 26/03/2019 | 63.06 | 64.25 | 63.66 |
| 27/03/2019 | 63.15 | 64.33 | 63.74 |
| 28/03/2019 | 63.24 | 64.43 | 63.84 |
| 29/03/2019 | 63.32 | 64.48 | 63.9 |
| 01/04/2019 | 63.37 | 64.57 | 63.97 |
| 02/04/2019 | 63.42 | 64.62 | 64.02 |
| 03/04/2019 | 63.47 | 64.67 | 64.07 |
| 04/04/2019 | 63.51 | 64.73 | 64.12 |
| 05/04/2019 | 63.55 | 64.77 | 64.16 |
| 09/04/2019 | 63.58 | 64.82 | 64.2 |
| 10/04/2019 | 63.6 | 64.83 | 64.22 |
| 11/04/2019 | 63.63 | 64.85 | 64.24 |
| 12/04/2019 | 63.65 | 64.89 | 64.27 |
| 15/04/2019 | 63.69 | 64.92 | 64.31 |
| 16/04/2019 | 63.79 | 64.98 | 64.39 |
| 17/04/2019 | 63.89 | 65.1 | 64.5 |
| 18/04/2019 | 63.99 | 65.22 | 64.61 |
| 22/04/2019 | 64.06 | 65.3 | 64.68 |
| 23/04/2019 | 64.09 | 65.34 | 64.72 |
| 24/04/2019 | 64.12 | 65.37 | 64.75 |
| 25/04/2019 | 64.07 | 65.3 | 64.69 |
| 26/04/2019 | 63.98 | 65.23 | 64.61 |
| 29/04/2019 | 63.89 | 65.14 | 64.52 |
| 30/04/2019 | 63.81 | 65.06 | 64.44 |
| 02/05/2019 | 63.72 | 64.97 | 64.35 |
| 03/05/2019 | 63.63 | 64.87 | 64.25 |
| 06/05/2019 | 63.54 | 64.77 | 64.16 |
| 07/05/2019 | 63.49 | 64.72 | 64.11 |
| 08/05/2019 | 63.41 | 64.63 | 64.02 |
| 09/05/2019 | 63.36 | 64.55 | 63.96 |
| 10/05/2019 | 63.24 | 64.49 | 63.87 |
| 13/05/2019 | 63.18 | 64.42 | 63.8 |
| 14/05/2019 | 63.15 | 64.4 | 63.78 |
| 15/05/2019 | 63.07 | 64.32 | 63.7 |
| 16/05/2019 | 63 | 64.26 | 63.63 |
| 17/05/2019 | 62.92 | 64.17 | 63.55 |
| 20/05/2019 | 62.82 | 64.06 | 63.44 |
| 21/05/2019 | 62.7 | 63.94 | 63.32 |
| 22/05/2019 | 62.42 | 63.62 | 63.02 |
| 23/05/2019 | 62.08 | 63.31 | 62.7 |
| 24/05/2019 | 61.87 | 63.1 | 62.49 |
| 27/05/2019 | 61.74 | 62.95 | 62.35 |
| 28/05/2019 | 61.69 | 62.89 | 62.29 |
| 29/05/2019 | 61.64 | 62.86 | 62.25 |
| 30/05/2019 | 61.65 | 62.84 | 62.25 |
| 31/05/2019 | 61.63 | 62.83 | 62.23 |
| 03/06/2019 | 61.62 | 62.83 | 62.23 |
| 04/06/2019 | 61.62 | 62.83 | 62.23 |
| 05/06/2019 | 61.61 | 62.82 | 62.22 |
| 06/06/2019 | 61.62 | 62.83 | 62.23 |
| 07/06/2019 | 61.62 | 62.84 | 62.23 |
| 10/06/2019 | 61.62 | 62.83 | 62.23 |
| 11/06/2019 | 61.62 | 62.84 | 62.23 |
| 12/06/2019 | 61.57 | 62.78 | 62.18 |
| 13/06/2019 | 61.5 | 62.7 | 62.1 |
| 14/06/2019 | 61.41 | 62.62 | 62.02 |
| 17/06/2019 | 61.37 | 62.58 | 61.98 |
| 18/06/2019 | 61.34 | 62.54 | 61.94 |
| 19/06/2019 | 61.38 | 62.55 | 61.97 |
| 20/06/2019 | 61.37 | 62.55 | 61.96 |
| 21/06/2019 | 61.4 | 62.59 | 62 |
| 24/06/2019 | 61.42 | 62.61 | 62.02 |
| 26/06/2019 | 61.45 | 62.61 | 62.03 |
| 27/06/2019 | 61.5 | 62.69 | 62.1 |
| 28/06/2019 | 61.52 | 62.71 | 62.12 |
| 01/07/2019 | 61.56 | 62.75 | 62.16 |
| 02/07/2019 | 61.61 | 62.81 | 62.21 |
| 03/07/2019 | 61.62 | 62.82 | 62.22 |
| 04/07/2019 | 61.6 | 62.8 | 62.2 |
| 05/07/2019 | 61.59 | 62.78 | 62.19 |
| 08/07/2019 | 61.57 | 62.75 | 62.16 |
| 09/07/2019 | 61.58 | 62.77 | 62.18 |
| 10/07/2019 | 61.59 | 62.77 | 62.18 |
| 11/07/2019 | 61.59 | 62.78 | 62.19 |
| 12/07/2019 | 61.59 | 62.75 | 62.17 |
| 15/07/2019 | 61.51 | 62.72 | 62.12 |
| 16/07/2019 | 61.46 | 62.66 | 62.06 |
| 17/07/2019 | 61.36 | 62.57 | 61.97 |
| 18/07/2019 | 61.3 | 62.52 | 61.91 |
| 19/07/2019 | 61.29 | 62.48 | 61.89 |
| 22/07/2019 | 61.25 | 62.44 | 61.85 |
| 23/07/2019 | 61.24 | 62.45 | 61.85 |
| 24/07/2019 | 61.26 | 62.45 | 61.86 |
| 25/07/2019 | 61.21 | 62.4 | 61.81 |
| 26/07/2019 | 61.14 | 62.34 | 61.74 |
| 29/07/2019 | 61.04 | 62.24 | 61.64 |
| 30/07/2019 | 60.97 | 62.16 | 61.57 |
| 31/07/2019 | 60.86 | 62.01 | 61.44 |
| 01/08/2019 | 60.76 | 61.89 | 61.33 |
| 02/08/2019 | 60.68 | 61.81 | 61.25 |
| 05/08/2019 | 60.61 | 61.74 | 61.18 |
| 06/08/2019 | 60.47 | 61.59 | 61.03 |
| 07/08/2019 | 60.29 | 61.43 | 60.86 |
| 08/08/2019 | 60.07 | 61.23 | 60.65 |
| 09/08/2019 | 59.96 | 61.12 | 60.54 |
| 12/08/2019 | 59.87 | 61.05 | 60.46 |
| 13/08/2019 | 59.86 | 61.03 | 60.45 |
| 14/08/2019 | 59.88 | 61.06 | 60.47 |
| 15/08/2019 | 59.91 | 61.09 | 60.5 |
| 16/08/2019 | 59.95 | 61.13 | 60.54 |
| 19/08/2019 | 60 | 61.18 | 60.59 |
| 20/08/2019 | 60.08 | 61.26 | 60.67 |
| 21/08/2019 | 60.12 | 61.32 | 60.72 |
| 22/08/2019 | 60.17 | 61.36 | 60.77 |
| 23/08/2019 | 60.29 | 61.48 | 60.89 |
| 26/08/2019 | 60.4 | 61.6 | 61 |
| 27/08/2019 | 60.49 | 61.69 | 61.09 |
| 28/08/2019 | 60.58 | 61.79 | 61.19 |
| 29/08/2019 | 60.67 | 61.88 | 61.28 |
| 30/08/2019 | 60.72 | 61.92 | 61.32 |
| 02/09/2019 | 60.77 | 61.98 | 61.38 |
| 03/09/2019 | 60.87 | 62.08 | 61.48 |
| 04/09/2019 | 60.93 | 62.14 | 61.54 |
| 05/09/2019 | 60.96 | 62.17 | 61.57 |
| 09/09/2019 | 61.02 | 62.23 | 61.63 |
| 10/09/2019 | 61.06 | 62.28 | 61.67 |
| 11/09/2019 | 61.09 | 62.3 | 61.7 |
| 12/09/2019 | 61.12 | 62.33 | 61.73 |
| 13/09/2019 | 61.14 | 62.36 | 61.75 |
| 16/09/2019 | 61.15 | 62.36 | 61.76 |
| 17/09/2019 | 61.15 | 62.36 | 61.76 |
| 18/09/2019 | 61.15 | 62.36 | 61.76 |
| 19/09/2019 | 61.16 | 62.37 | 61.77 |
| 20/09/2019 | 61.18 | 62.39 | 61.79 |
| 23/09/2019 | 61.22 | 62.44 | 61.83 |
| 24/09/2019 | 61.27 | 62.48 | 61.88 |
| 26/09/2019 | 61.29 | 62.51 | 61.9 |
| 27/09/2019 | 61.3 | 62.53 | 61.92 |
| 30/09/2019 | 61.32 | 62.55 | 61.94 |
| 01/10/2019 | 61.34 | 62.56 | 61.95 |
| 02/10/2019 | 61.36 | 62.58 | 61.97 |
| 03/10/2019 | 61.38 | 62.6 | 61.99 |
| 07/10/2019 | 61.41 | 62.63 | 62.02 |
| 08/10/2019 | 61.44 | 62.66 | 62.05 |
| 09/10/2019 | 61.48 | 62.71 | 62.1 |
| 10/10/2019 | 61.52 | 62.75 | 62.14 |
| 11/10/2019 | 61.55 | 62.78 | 62.17 |
| 14/10/2019 | 61.59 | 62.82 | 62.21 |
| 16/10/2019 | 61.63 | 62.85 | 62.24 |
| 17/10/2019 | 61.67 | 62.89 | 62.28 |
| 18/10/2019 | 61.71 | 62.94 | 62.33 |
| 21/10/2019 | 61.77 | 63 | 62.39 |
| 22/10/2019 | 61.8 | 63.04 | 62.42 |
| 23/10/2019 | 61.84 | 63.08 | 62.46 |
| 24/10/2019 | 61.89 | 63.13 | 62.51 |
| 25/10/2019 | 61.97 | 63.2 | 62.59 |
| 28/10/2019 | 62.01 | 63.25 | 62.63 |
| 29/10/2019 | 62.05 | 63.29 | 62.67 |
| 30/10/2019 | 62.12 | 63.36 | 62.74 |
| 31/10/2019 | 62.19 | 63.42 | 62.81 |
| 01/11/2019 | 62.25 | 63.48 | 62.87 |
| 04/11/2019 | 62.3 | 63.54 | 62.92 |
| 05/11/2019 | 62.34 | 63.59 | 62.97 |
| 06/11/2019 | 62.38 | 63.62 | 63 |
| 07/11/2019 | 62.42 | 63.66 | 63.04 |
| 08/11/2019 | 62.47 | 63.71 | 63.09 |
| 11/11/2019 | 62.52 | 63.77 | 63.15 |
| 12/11/2019 | 62.59 | 63.83 | 63.21 |
| 13/11/2019 | 62.63 | 63.87 | 63.25 |
| 14/11/2019 | 62.69 | 63.93 | 63.31 |
| 15/11/2019 | 62.74 | 63.99 | 63.37 |
| 18/11/2019 | 62.83 | 64.07 | 63.45 |
| 19/11/2019 | 62.99 | 64.25 | 63.62 |
| 20/11/2019 | 63.13 | 64.38 | 63.76 |
| 21/11/2019 | 63.2 | 64.44 | 63.82 |
| 22/11/2019 | 63.24 | 64.5 | 63.87 |
| 25/11/2019 | 63.27 | 64.5 | 63.89 |
| 26/11/2019 | 63.32 | 64.56 | 63.94 |
| 27/11/2019 | 63.4 | 64.65 | 64.03 |
| 28/11/2019 | 63.44 | 64.69 | 64.07 |
| 29/11/2019 | 63.46 | 64.7 | 64.08 |
| 02/12/2019 | 63.46 | 64.72 | 64.09 |
| 03/12/2019 | 63.44 | 64.69 | 64.07 |
| 04/12/2019 | 63.43 | 64.69 | 64.06 |
| 05/12/2019 | 63.4 | 64.63 | 64.02 |
| 06/12/2019 | 63.34 | 64.57 | 63.96 |
| 09/12/2019 | 63.28 | 64.52 | 63.9 |
| 10/12/2019 | 63.21 | 64.45 | 63.83 |
| 11/12/2019 | 63.16 | 64.4 | 63.78 |
| 12/12/2019 | 63.07 | 64.31 | 63.69 |
| 13/12/2019 | 62.98 | 64.22 | 63.6 |
| 16/12/2019 | 62.87 | 64.11 | 63.49 |
| 17/12/2019 | 62.74 | 63.98 | 63.36 |
| 18/12/2019 | 62.54 | 63.77 | 63.16 |
| 19/12/2019 | 62.29 | 63.52 | 62.91 |
| 20/12/2019 | 62 | 63.23 | 62.62 |
| 23/12/2019 | 61.65 | 62.87 | 62.26 |
| 24/12/2019 | 61.3 | 62.51 | 61.91 |
| 26/12/2019 | 61.1 | 62.31 | 61.71 |
| 27/12/2019 | 60.92 | 62.12 | 61.52 |
| 30/12/2019 | 60.83 | 62.03 | 61.43 |
| 31/12/2019 | 60.86 | 62.07 | 61.47 |
| 02/01/2020 | 60.88 | 62.09 | 61.49 |
| 03/01/2020 | 60.92 | 62.13 | 61.53 |
| 06/01/2020 | 61.02 | 62.23 | 61.63 |
| 07/01/2020 | 61.13 | 62.34 | 61.74 |
| 08/01/2020 | 61.23 | 62.44 | 61.84 |
| 09/01/2020 | 61.35 | 62.56 | 61.96 |
| 10/01/2020 | 61.45 | 62.66 | 62.06 |
| 13/01/2020 | 61.55 | 62.77 | 62.16 |
| 14/01/2020 | 61.63 | 62.85 | 62.24 |
| 16/01/2020 | 61.74 | 62.95 | 62.35 |
| 17/01/2020 | 61.88 | 63.08 | 62.48 |
| 20/01/2020 | 62.03 | 63.25 | 62.64 |
| 21/01/2020 | 62.23 | 63.44 | 62.84 |
| 22/01/2020 | 62.41 | 63.64 | 63.03 |
| 23/01/2020 | 62.59 | 63.83 | 63.21 |
| 24/01/2020 | 62.76 | 64 | 63.38 |
| 27/01/2020 | 62.91 | 64.16 | 63.54 |
| 28/01/2020 | 63.03 | 64.26 | 63.65 |
| 29/01/2020 | 63.16 | 64.42 | 63.79 |
| 30/01/2020 | 63.22 | 64.47 | 63.85 |
| 31/01/2020 | 63.26 | 64.52 | 63.89 |
| 04/02/2020 | 63.3 | 64.57 | 63.94 |
| 05/02/2020 | 63.37 | 64.64 | 64.01 |
| 06/02/2020 | 63.41 | 64.67 | 64.04 |
| 07/02/2020 | 63.48 | 64.74 | 64.11 |
| 10/02/2020 | 63.53 | 64.79 | 64.16 |
| 11/02/2020 | 63.57 | 64.84 | 64.21 |
| 12/02/2020 | 63.63 | 64.9 | 64.27 |
| 13/02/2020 | 63.71 | 64.97 | 64.34 |
| 14/02/2020 | 63.8 | 65.07 | 64.44 |
| 17/02/2020 | 63.87 | 65.14 | 64.51 |
| 18/02/2020 | 63.96 | 65.24 | 64.6 |
| 19/02/2020 | 64.06 | 65.34 | 64.7 |
| 20/02/2020 | 64.19 | 65.46 | 64.83 |
| 21/02/2020 | 64.25 | 65.53 | 64.89 |
| 24/02/2020 | 64.32 | 65.61 | 64.97 |
| 25/02/2020 | 64.42 | 65.71 | 65.07 |
| 26/02/2020 | 64.49 | 65.77 | 65.13 |
| 27/02/2020 | 64.56 | 65.85 | 65.21 |
| 28/02/2020 | 64.63 | 65.91 | 65.27 |
| 02/03/2020 | 64.7 | 65.99 | 65.35 |
| 03/03/2020 | 64.77 | 66.04 | 65.41 |
| 04/03/2020 | 64.83 | 66.13 | 65.48 |
| 05/03/2020 | 64.88 | 66.18 | 65.53 |
| 06/03/2020 | 64.92 | 66.22 | 65.57 |
| 09/03/2020 | 64.98 | 66.27 | 65.63 |
| 10/03/2020 | 65.04 | 66.34 | 65.69 |
| 11/03/2020 | 65.1 | 66.4 | 65.75 |
| 12/03/2020 | 65.2 | 66.5 | 65.85 |
| 13/03/2020 | 65.26 | 66.55 | 65.91 |
| 16/03/2020 | 65.3 | 66.61 | 65.96 |
| 17/03/2020 | 65.38 | 66.68 | 66.03 |
| 18/03/2020 | 65.54 | 66.85 | 66.2 |
| 19/03/2020 | 65.65 | 66.96 | 66.31 |
| 20/03/2020 | 65.72 | 67.01 | 66.37 |
| 23/03/2020 | 65.78 | 67.09 | 66.44 |
| 24/03/2020 | 65.84 | 67.16 | 66.5 |
| 25/03/2020 | 65.88 | 67.19 | 66.54 |
| 26/03/2020 | 65.92 | 67.24 | 66.58 |
| 27/03/2020 | 65.96 | 67.28 | 66.62 |
| 30/03/2020 | 66.01 | 67.33 | 66.67 |
| 31/03/2020 | 66.07 | 67.38 | 66.73 |
| 01/04/2020 | 66.11 | 67.43 | 66.77 |
| 02/04/2020 | 66.15 | 67.47 | 66.81 |
| 03/04/2020 | 66.17 | 67.49 | 66.83 |
| 06/04/2020 | 66.23 | 67.55 | 66.89 |
| 08/04/2020 | 66.29 | 67.6 | 66.95 |
| 09/04/2020 | 66.36 | 67.68 | 67.02 |
| 13/04/2020 | 66.43 | 67.75 | 67.09 |
| 14/04/2020 | 66.49 | 67.82 | 67.16 |
| 15/04/2020 | 66.54 | 67.86 | 67.2 |
| 16/04/2020 | 66.57 | 67.9 | 67.24 |
| 17/04/2020 | 66.62 | 67.95 | 67.29 |
| 20/04/2020 | 66.67 | 68 | 67.34 |
| 21/04/2020 | 66.74 | 68.07 | 67.41 |
| 22/04/2020 | 66.79 | 68.12 | 67.46 |
| 23/04/2020 | 66.86 | 68.19 | 67.53 |
| 24/04/2020 | 66.92 | 68.25 | 67.59 |
| 27/04/2020 | 66.98 | 68.32 | 67.65 |
| 28/04/2020 | 67.04 | 68.38 | 67.71 |
| 29/04/2020 | 67.09 | 68.43 | 67.76 |
| 30/04/2020 | 67.16 | 68.49 | 67.83 |
| 04/05/2020 | 67.21 | 68.55 | 67.88 |
| 05/05/2020 | 67.24 | 68.58 | 67.91 |
| 06/05/2020 | 67.28 | 68.62 | 67.95 |
| 07/05/2020 | 67.36 | 68.7 | 68.03 |
| 08/05/2020 | 67.42 | 68.76 | 68.09 |
| 11/05/2020 | 67.45 | 68.79 | 68.12 |
| 12/05/2020 | 67.5 | 68.85 | 68.18 |
| 13/05/2020 | 67.57 | 68.92 | 68.25 |
| 14/05/2020 | 67.65 | 68.99 | 68.32 |
| 15/05/2020 | 67.76 | 69.11 | 68.44 |
| 18/05/2020 | 67.88 | 69.24 | 68.56 |
| 19/05/2020 | 67.97 | 69.33 | 68.65 |
| 20/05/2020 | 68.06 | 69.41 | 68.74 |
| 21/05/2020 | 68.11 | 69.46 | 68.79 |
| 22/05/2020 | 68.18 | 69.54 | 68.86 |
| 25/05/2020 | 68.26 | 69.63 | 68.95 |
| 26/05/2020 | 68.34 | 69.7 | 69.02 |
| 27/05/2020 | 68.43 | 69.79 | 69.11 |
| 28/05/2020 | 68.55 | 69.89 | 69.22 |
| 29/05/2020 | 68.63 | 70 | 69.32 |
| 01/06/2020 | 68.69 | 70.07 | 69.38 |
| 02/06/2020 | 68.72 | 70.1 | 69.41 |
| 03/06/2020 | 68.74 | 70.11 | 69.43 |
| 04/06/2020 | 68.76 | 70.14 | 69.45 |
| 05/06/2020 | 68.79 | 70.16 | 69.48 |
| 08/06/2020 | 68.84 | 70.21 | 69.53 |
| 09/06/2020 | 68.89 | 70.27 | 69.58 |
| 10/06/2020 | 68.92 | 70.3 | 69.61 |
| 11/06/2020 | 68.95 | 70.33 | 69.64 |
| 12/06/2020 | 69 | 70.38 | 69.69 |
| 15/06/2020 | 69.05 | 70.42 | 69.74 |
| 16/06/2020 | 69.08 | 70.45 | 69.77 |
| 17/06/2020 | 69.12 | 70.49 | 69.81 |
| 18/06/2020 | 69.17 | 70.54 | 69.86 |
| 19/06/2020 | 69.2 | 70.58 | 69.89 |
| 22/06/2020 | 69.22 | 70.6 | 69.91 |
| 23/06/2020 | 69.25 | 70.63 | 69.94 |
| 24/06/2020 | 69.3 | 70.68 | 69.99 |
| 26/06/2020 | 69.34 | 70.73 | 70.04 |
| 29/06/2020 | 69.38 | 70.77 | 70.08 |
| 30/06/2020 | 69.42 | 70.8 | 70.11 |
| 01/07/2020 | 69.43 | 70.82 | 70.13 |
| 02/07/2020 | 69.46 | 70.84 | 70.15 |
| 03/07/2020 | 69.46 | 70.85 | 70.16 |
| 06/07/2020 | 69.48 | 70.86 | 70.17 |
| 07/07/2020 | 69.5 | 70.89 | 70.2 |
| 08/07/2020 | 69.53 | 70.91 | 70.22 |
| 09/07/2020 | 69.57 | 70.95 | 70.26 |
| 10/07/2020 | 69.6 | 70.99 | 70.3 |
| 13/07/2020 | 69.65 | 71.03 | 70.34 |
| 14/07/2020 | 69.68 | 71.07 | 70.38 |
| 15/07/2020 | 69.72 | 71.11 | 70.42 |
| 16/07/2020 | 69.74 | 71.13 | 70.44 |
| 17/07/2020 | 69.78 | 71.17 | 70.48 |
| 20/07/2020 | 69.82 | 71.21 | 70.52 |
| 21/07/2020 | 69.86 | 71.26 | 70.56 |
| 22/07/2020 | 69.9 | 71.29 | 70.6 |
| 23/07/2020 | 69.93 | 71.32 | 70.63 |
| 24/07/2020 | 69.95 | 71.35 | 70.65 |
| 27/07/2020 | 69.98 | 71.38 | 70.68 |
| 28/07/2020 | 70.01 | 71.41 | 70.71 |
| 29/07/2020 | 70.08 | 71.47 | 70.78 |
| 30/07/2020 | 70.12 | 71.52 | 70.82 |
| 31/07/2020 | 70.17 | 71.57 | 70.87 |
| 03/08/2020 | 70.22 | 71.62 | 70.92 |
| 04/08/2020 | 70.26 | 71.66 | 70.96 |
| 05/08/2020 | 70.3 | 71.71 | 71.01 |
| 06/08/2020 | 70.32 | 71.72 | 71.02 |
| 07/08/2020 | 70.34 | 71.74 | 71.04 |
| 10/08/2020 | 70.36 | 71.76 | 71.06 |
| 11/08/2020 | 70.39 | 71.8 | 71.1 |
| 12/08/2020 | 70.42 | 71.82 | 71.12 |
| 13/08/2020 | 70.43 | 71.83 | 71.13 |
| 14/08/2020 | 70.46 | 71.86 | 71.16 |
| 17/08/2020 | 70.5 | 71.9 | 71.2 |
| 18/08/2020 | 70.53 | 71.94 | 71.24 |
| 19/08/2020 | 70.57 | 71.98 | 71.28 |
| 20/08/2020 | 70.61 | 72.01 | 71.31 |
| 21/08/2020 | 70.63 | 72.03 | 71.33 |
| 24/08/2020 | 70.66 | 72.07 | 71.37 |
| 25/08/2020 | 70.72 | 72.12 | 71.42 |
| 26/08/2020 | 70.77 | 72.18 | 71.48 |
| 27/08/2020 | 70.81 | 72.23 | 71.52 |
| 28/08/2020 | 70.86 | 72.27 | 71.57 |
| 31/08/2020 | 70.9 | 72.31 | 71.61 |
| 01/09/2020 | 70.95 | 72.37 | 71.66 |
| 02/09/2020 | 70.99 | 72.4 | 71.7 |
| 03/09/2020 | 71.01 | 72.42 | 71.72 |
| 04/09/2020 | 71.01 | 72.43 | 71.72 |
| 08/09/2020 | 71.04 | 72.45 | 71.75 |
| 09/09/2020 | 71.07 | 72.49 | 71.78 |
| 10/09/2020 | 71.1 | 72.52 | 71.81 |
| 11/09/2020 | 71.11 | 72.53 | 71.82 |
| 14/09/2020 | 71.13 | 72.55 | 71.84 |
| 15/09/2020 | 71.17 | 72.59 | 71.88 |
| 16/09/2020 | 71.18 | 72.6 | 71.89 |
| 17/09/2020 | 71.2 | 71.62 | 71.91 |
| 18/09/2020 | 71.22 | 72.64 | 71.93 |
| 21/09/2020 | 71.24 | 72.66 | 71.95 |
| 22/09/2020 | 71.28 | 72.7 | 71.99 |
| 23/09/2020 | 71.31 | 72.74 | 72.03 |
| 24/09/2020 | 71.36 | 72.78 | 72.07 |
| 28/09/2020 | 71.4 | 72.83 | 72.12 |
| 29/09/2020 | 71.47 | 72.9 | 72.19 |
| 30/09/2020 | 71.57 | 72.99 | 72.28 |
| 01/10/2020 | 71.62 | 73.05 | 72.34 |
| 02/10/2020 | 71.67 | 73.1 | 72.39 |
| 06/10/2020 | 71.73 | 73.16 | 72.45 |
| 07/10/2020 | 71.79 | 73.21 | 72.5 |
| 08/10/2020 | 71.84 | 73.28 | 72.56 |
| 09/10/2020 | 71.89 | 73.32 | 72.61 |
| 12/10/2020 | 71.92 | 73.36 | 72.64 |
| 13/10/2020 | 71.95 | 73.39 | 72.67 |
| 14/10/2020 | 72.01 | 73.45 | 72.73 |
| 15/10/2020 | 72.06 | 73.5 | 72.78 |
| 16/10/2020 | 72.09 | 73.53 | 72.81 |
| 19/10/2020 | 72.12 | 73.56 | 72.84 |
| 20/10/2020 | 72.16 | 73.6 | 72.88 |
| 21/10/2020 | 72.19 | 73.63 | 72.91 |
| 22/10/2020 | 72.23 | 73.67 | 72.95 |
| 23/10/2020 | 72.27 | 73.72 | 73 |
| 26/10/2020 | 72.32 | 73.76 | 73.04 |
| 27/10/2020 | 72.37 | 73.81 | 73.09 |
| 28/10/2020 | 72.4 | 73.84 | 73.12 |
| 29/10/2020 | 72.45 | 73.9 | 73.18 |
| 30/10/2020 | 72.51 | 73.96 | 73.24 |
| 02/11/2020 | 72.54 | 73.99 | 73.27 |
| 03/11/2020 | 72.57 | 74.02 | 73.3 |
| 04/11/2020 | 72.61 | 74.06 | 73.34 |
| 05/11/2020 | 72.64 | 74.09 | 73.37 |
| 06/11/2020 | 72.67 | 74.11 | 73.39 |
| 09/11/2020 | 72.71 | 74.16 | 73.44 |
| 11/11/2020 | 72.73 | 74.18 | 73.46 |
| 12/11/2020 | 72.79 | 74.25 | 73.52 |
| 13/11/2020 | 72.86 | 74.31 | 73.59 |
| 16/11/2020 | 72.97 | 74.41 | 73.69 |
| 17/11/2020 | 73.03 | 74.47 | 73.75 |
| 18/11/2020 | 73.09 | 74.53 | 73.81 |
| 19/11/2020 | 73.12 | 74.57 | 73.85 |
| 20/11/2020 | 73.15 | 74.59 | 73.87 |
| 23/11/2020 | 73.18 | 74.63 | 73.91 |
| 24/11/2020 | 73.3 | 74.76 | 74.03 |
| 25/11/2020 | 73.36 | 74.81 | 74.09 |
| 26/11/2020 | 73.41 | 74.87 | 74.14 |
| 27/11/2020 | 73.45 | 74.91 | 74.18 |
| 30/11/2020 | 73.5 | 74.97 | 74.24 |
| 01/12/2020 | 73.52 | 75 | 74.26 |
| 02/12/2020 | 73.51 | 75.01 | 74.26 |
| 03/12/2020 | 73.51 | 75.01 | 74.26 |
| 04/12/2020 | 73.54 | 75.03 | 74.29 |
| 07/12/2020 | 73.59 | 75.09 | 74.34 |
| 08/12/2020 | 73.64 | 75.12 | 74.38 |
| 09/12/2020 | 73.69 | 75.16 | 74.43 |
| 10/12/2020 | 73.73 | 75.21 | 74.47 |
| 11/12/2020 | 73.79 | 75.26 | 74.53 |
| 14/12/2020 | 73.89 | 75.36 | 74.63 |
| 15/12/2020 | 73.95 | 75.43 | 74.69 |
| 16/12/2020 | 74.02 | 75.5 | 74.76 |
| 17/12/2020 | 74.04 | 75.52 | 74.78 |
| 18/12/2020 | 74.06 | 75.54 | 74.8 |
| 21/12/2020 | 74.06 | 75.54 | 74.8 |
| 22/12/2020 | 74.08 | 75.56 | 74.82 |
| 23/12/2020 | 74.11 | 75.59 | 74.85 |
| 28/12/2020 | 74.14 | 75.62 | 74.88 |
| 29/12/2020 | 74.15 | 75.63 | 74.89 |
| 30/12/2020 | 74.16 | 75.64 | 74.9 |
| 31/12/2020 | 74.16 | 75.64 | 74.9 |
| 04/01/2021 | 74.17 | 75.65 | 74.91 |
| 05/01/2021 | 74.16 | 75.64 | 74.9 |
| 06/01/2021 | 74.17 | 75.66 | 74.92 |
| 07/01/2021 | 74.18 | 75.67 | 74.93 |
| 08/01/2021 | 74.18 | 75.67 | 74.93 |
| 11/01/2021 | 74.2 | 75.68 | 74.94 |
| 12/01/2021 | 74.24 | 75.72 | 74.98 |
| 13/01/2021 | 74.25 | 75.74 | 75 |
| 14/01/2021 | 74.28 | 75.77 | 75.03 |
| 15/01/2021 | 74.3 | 75.79 | 75.05 |
| 18/01/2021 | 74.33 | 75.81 | 75.07 |
| 19/01/2021 | 74.34 | 75.82 | 75.08 |
| 20/01/2021 | 74.36 | 75.85 | 75.11 |
| 21/01/2021 | 74.37 | 75.86 | 75.12 |
| 22/01/2021 | 74.38 | 75.86 | 75.12 |
| 25/01/2021 | 74.39 | 75.87 | 75.13 |
| 26/01/2021 | 74.42 | 75.9 | 75.16 |
| 27/01/2021 | 74.44 | 75.92 | 75.18 |
| 28/01/2021 | 74.47 | 75.95 | 75.21 |
| 29/01/2021 | 74.51 | 75.99 | 75.25 |
| 01/02/2021 | 74.52 | 76.01 | 75.27 |
| 02/02/2021 | 74.52 | 76 | 75.26 |
| 04/02/2021 | 74.52 | 76.01 | 75.27 |
| 05/02/2021 | 74.52 | 76.01 | 75.27 |
| 08/02/2021 | 74.52 | 76.01 | 75.27 |
| 09/02/2021 | 74.5 | 75.99 | 75.25 |
| 10/02/2021 | 74.47 | 75.96 | 75.22 |
| 11/02/2021 | 74.45 | 75.93 | 75.19 |
| 12/02/2021 | 74.44 | 75.92 | 75.18 |
| 15/02/2021 | 74.42 | 75.91 | 75.17 |
| 16/02/2021 | 74.42 | 75.9 | 75.16 |
| 17/02/2021 | 74.37 | 75.85 | 75.11 |
| 18/02/2021 | 74.35 | 75.84 | 75.1 |
| 19/02/2021 | 74.34 | 75.83 | 75.09 |
| 22/02/2021 | 74.31 | 75.8 | 75.06 |
| 23/02/2021 | 74.28 | 75.76 | 75.02 |
| 24/02/2021 | 74.2 | 75.68 | 74.94 |
| 25/02/2021 | 74.16 | 75.64 | 74.9 |
| 26/02/2021 | 74.07 | 75.55 | 74.81 |
| 01/03/2021 | 74.03 | 75.51 | 74.77 |
| 02/03/2021 | 73.98 | 75.46 | 74.72 |
| 03/03/2021 | 73.89 | 75.37 | 74.63 |
| 04/03/2021 | 73.82 | 75.3 | 74.56 |
| 05/03/2021 | 73.79 | 75.27 | 74.53 |
| 08/03/2021 | 73.76 | 75.24 | 74.5 |
| 09/03/2021 | 73.61 | 75.09 | 74.35 |
| 10/03/2021 | 73.44 | 74.91 | 74.18 |
| 11/03/2021 | 73.17 | 74.64 | 73.91 |
| 12/03/2021 | 72.98 | 74.44 | 73.71 |
| 15/03/2021 | 72.76 | 74.22 | 73.49 |
| 16/03/2021 | 72.54 | 73.98 | 73.26 |
| 17/03/2021 | 72.15 | 73.59 | 72.87 |
| 18/03/2021 | 71.72 | 73.16 | 72.44 |
| 19/03/2021 | 71.51 | 72.94 | 72.23 |
| 22/03/2021 | 71.32 | 72.74 | 72.03 |
| 23/03/2021 | 70.94 | 72.36 | 71.65 |
| 24/03/2021 | 70.47 | 71.88 | 71.18 |
| 25/03/2021 | 70.07 | 71.47 | 70.77 |
| 26/03/2021 | 69.47 | 70.86 | 70.17 |
| 29/03/2021 | 68.67 | 69.93 | 69.3 |
| 30/03/2021 | 68.1 | 69.46 | 68.78 |
| 31/03/2021 | 66.78 | 68.12 | 67.45 |
| 01/04/2021 | 66.39 | 67.71 | 67.05 |
| 05/04/2021 | 65.8 | 67.12 | 66.46 |
| 06/04/2021 | 64.88 | 66.18 | 65.53 |
| 08/04/2021 | 63.63 | 64.88 | 64.26 |
| 09/04/2021 | 60.63 | 61.84 | 61.24 |
| 12/04/2021 | 57.91 | 59.06 | 58.49 |
| 13/04/2021 | 56.04 | 57.09 | 56.57 |
| 14/04/2021 | 55.24 | 56.34 | 55.79 |
| 15/04/2021 | 54.98 | 56.04 | 55.51 |
| 16/04/2021 | 55 | 56.1 | 55.55 |
| 19/04/2021 | 55.01 | 56.11 | 55.56 |
| 20/04/2021 | 55.01 | 56.11 | 55.56 |
| 21/04/2021 | 55.01 | 56.11 | 55.56 |
| 22/04/2021 | 55.05 | 56.16 | 55.61 |
| 23/04/2021 | 55.09 | 56.19 | 55.64 |
| 26/04/2021 | 55.85 | 56.97 | 56.41 |
| 27/04/2021 | 56.04 | 57.16 | 56.6 |
| 28/04/2021 | 56.82 | 57.96 | 57.39 |
| 29/04/2021 | 57.01 | 58.15 | 57.58 |
| 30/04/2021 | 57.02 | 58.16 | 57.59 |
| 03/05/2021 | 57.02 | 58.16 | 57.59 |
| 04/05/2021 | 57.1 | 58.24 | 57.67 |
| 05/05/2021 | 57.34 | 58.48 | 57.91 |
| 06/05/2021 | 57.48 | 58.63 | 58.06 |
| 07/05/2021 | 57.61 | 58.76 | 58.19 |
| 10/05/2021 | 57.93 | 59.09 | 58.51 |
| 11/05/2021 | 58 | 59.16 | 58.58 |
| 12/05/2021 | 58.13 | 59.3 | 58.72 |
| 13/05/2021 | 58.27 | 59.43 | 58.85 |
| 14/05/2021 | 58.44 | 59.6 | 59.02 |
| 17/05/2021 | 58.52 | 59.68 | 59.1 |
| 18/05/2021 | 58.68 | 59.85 | 59.27 |
| 19/05/2021 | 58.96 | 60.14 | 59.55 |
| 20/05/2021 | 59.08 | 60.26 | 59.67 |
| 21/05/2021 | 59.12 | 60.3 | 59.71 |
| 24/05/2021 | 59.3 | 60.48 | 59.89 |
| 25/05/2021 | 59.54 | 60.73 | 60.14 |
| 26/05/2021 | 59.98 | 61.18 | 60.58 |
| 27/05/2021 | 60.17 | 61.37 | 60.77 |
| 28/05/2021 | 60.27 | 61.47 | 60.87 |
| 31/05/2021 | 60.44 | 61.64 | 61.04 |
| 01/06/2021 | 60.52 | 61.73 | 61.13 |
| 02/06/2021 | 60.8 | 62.01 | 61.41 |
| 03/06/2021 | 61 | 62.22 | 61.61 |
| 04/06/2021 | 61.07 | 62.29 | 61.68 |
| 07/06/2021 | 61.15 | 62.37 | 61.76 |
| 08/06/2021 | 61.4 | 62.63 | 62.02 |
| 09/06/2021 | 61.48 | 62.7 | 62.09 |
| 10/06/2021 | 61.59 | 62.82 | 62.21 |
| 11/06/2021 | 61.74 | 62.98 | 62.36 |
| 14/06/2021 | 61.83 | 63.06 | 62.45 |
| 15/06/2021 | 62.09 | 63.33 | 62.71 |
| 16/06/2021 | 62.18 | 63.42 | 62.8 |
| 17/06/2021 | 62.31 | 63.55 | 62.93 |
| 18/06/2021 | 62.41 | 63.66 | 63.04 |
| 21/06/2021 | 62.47 | 63.72 | 63.1 |
| 22/06/2021 | 62.51 | 63.76 | 63.14 |
| 23/06/2021 | 62.61 | 63.86 | 63.24 |
| 24/06/2021 | 62.65 | 63.9 | 63.28 |
| 28/06/2021 | 62.7 | 63.95 | 63.33 |
| 29/06/2021 | 62.79 | 64.04 | 63.42 |
| 30/06/2021 | 62.88 | 64.14 | 63.51 |
| 01/07/2021 | 62.9 | 64.15 | 63.53 |
| 02/07/2021 | 62.89 | 64.14 | 63.52 |
| 05/07/2021 | 62.89 | 64.14 | 63.52 |
| 06/07/2021 | 62.91 | 64.16 | 63.54 |
| 07/07/2021 | 62.91 | 64.16 | 63.54 |
| 08/07/2021 | 62.91 | 64.17 | 63.54 |
| 09/07/2021 | 62.91 | 64.17 | 63.54 |
| 12/07/2021 | 62.93 | 64.18 | 63.56 |
| 13/07/2021 | 62.95 | 64.2 | 63.58 |
| 14/07/2021 | 62.95 | 64.21 | 63.58 |
| 15/07/2021 | 62.97 | 64.22 | 63.6 |
| 16/07/2021 | 62.96 | 64.22 | 63.59 |
| 19/07/2021 | 62.97 | 64.23 | 63.6 |
| 20/07/2021 | 62.98 | 64.24 | 63.61 |
| 21/07/2021 | 62.99 | 64.23 | 63.61 |
| 22/07/2021 | 62.99 | 64.24 | 63.62 |
| 23/07/2021 | 63 | 64.26 | 63.63 |
| 26/07/2021 | 63 | 64.26 | 63.63 |
| 27/07/2021 | 63 | 64.26 | 63.63 |
| 28/07/2021 | 63 | 64.26 | 63.63 |
| 29/07/2021 | 63 | 64.26 | 63.63 |
| 30/07/2021 | 63 | 64.26 | 63.63 |
| 02/08/2021 | 63 | 64.26 | 63.63 |
| 03/08/2021 | 63 | 64.26 | 63.63 |
| 04/08/2021 | 63 | 64.26 | 63.63 |
| 05/08/2021 | 63 | 64.26 | 63.63 |
| 06/08/2021 | 63.01 | 64.27 | 63.64 |
| 09/08/2021 | 63.01 | 64.27 | 63.64 |
| 10/08/2021 | 63.01 | 64.27 | 63.64 |
| 11/08/2021 | 63.03 | 64.29 | 63.66 |
| 12/08/2021 | 63.03 | 64.29 | 63.66 |
| 13/08/2021 | 63.04 | 64.3 | 63.67 |
| 16/08/2021 | 63.05 | 64.31 | 63.68 |
| 17/08/2021 | 63.05 | 64.31 | 63.68 |
| 18/08/2021 | 63.05 | 64.31 | 63.68 |
| 19/08/2021 | 63.05 | 64.31 | 63.68 |
| 20/08/2021 | 63.06 | 64.32 | 63.69 |
| 23/08/2021 | 63.08 | 64.34 | 63.71 |
| 24/08/2021 | 63.09 | 64.34 | 63.72 |
| 25/08/2021 | 63.09 | 64.35 | 63.72 |
| 26/08/2021 | 63.1 | 64.35 | 63.73 |
| 27/08/2021 | 63.1 | 64.35 | 63.73 |
| 30/08/2021 | 63.11 | 64.36 | 63.74 |
| 31/08/2021 | 63.13 | 64.38 | 63.76 |
| 01/09/2021 | 63.14 | 64.4 | 63.77 |
| 02/09/2021 | 63.14 | 64.39 | 63.77 |
| 03/09/2021 | 63.15 | 64.4 | 63.78 |
| 06/09/2021 | 63.15 | 64.4 | 63.78 |
| 08/09/2021 | 63.15 | 64.4 | 63.78 |
| 09/09/2021 | 63.15 | 64.4 | 63.78 |
| 10/09/2021 | 63.15 | 64.4 | 63.78 |
| 13/09/2021 | 63.15 | 64.4 | 63.78 |
| 14/09/2021 | 63.16 | 64.41 | 63.79 |
| 15/09/2021 | 63.18 | 64.42 | 63.8 |
| 16/09/2021 | 63.18 | 64.44 | 63.81 |
| 17/09/2021 | 63.19 | 64.45 | 63.82 |
| 20/09/2021 | 63.2 | 64.46 | 63.83 |
| 21/09/2021 | 63.2 | 64.46 | 63.83 |
| 22/09/2021 | 63.2 | 64.46 | 63.83 |
| 23/09/2021 | 63.2 | 64.46 | 63.83 |
| 24/09/2021 | 63.2 | 64.46 | 63.83 |
| 27/09/2021 | 63.2 | 64.46 | 63.83 |
| 28/09/2021 | 63.2 | 64.46 | 63.83 |
| 29/09/2021 | 63.2 | 64.46 | 63.83 |
| 30/09/2021 | 63.2 | 64.46 | 63.83 |
| 01/10/2021 | 63.2 | 64.46 | 63.83 |
| 05/10/2021 | 63.2 | 64.46 | 63.83 |
| 06/10/2021 | 63.2 | 64.46 | 63.83 |
| 07/10/2021 | 63.2 | 64.46 | 63.83 |
| 08/10/2021 | 63.2 | 64.46 | 63.83 |
| 11/10/2021 | 63.2 | 64.46 | 63.83 |
| 12/10/2021 | 63.2 | 64.46 | 63.83 |
| 13/10/2021 | 63.2 | 64.46 | 63.83 |
| 14/10/2021 | 63.2 | 64.46 | 63.83 |
| 15/10/2021 | 63.2 | 64.46 | 63.83 |
| 18/10/2021 | 63.2 | 64.46 | 63.83 |
| 19/10/2021 | 63.2 | 64.46 | 63.83 |
| 20/10/2021 | 63.2 | 64.46 | 63.83 |
| 21/10/2021 | 63.2 | 64.46 | 63.83 |
| 22/10/2021 | 63.2 | 64.46 | 63.83 |
| 25/10/2021 | 63.2 | 64.46 | 63.83 |
| 26/10/2021 | 63.2 | 64.46 | 63.83 |
| 27/10/2021 | 63.2 | 64.46 | 63.83 |
| 28/10/2021 | 63.2 | 64.46 | 63.83 |
| 29/10/2021 | 63.2 | 64.46 | 63.83 |
| 01/11/2021 | 63.2 | 64.46 | 63.83 |
| 02/11/2021 | 63.2 | 64.46 | 63.83 |
| 03/11/2021 | 63.2 | 64.46 | 63.83 |
| 04/11/2021 | 63.2 | 64.46 | 63.83 |
| 05/11/2021 | 63.2 | 64.46 | 63.83 |
| 08/11/2021 | 63.2 | 64.46 | 63.83 |
| 09/11/2021 | 63.2 | 64.46 | 63.83 |
| 11/11/2021 | 63.2 | 64.46 | 63.83 |
| 12/11/2021 | 63.2 | 64.46 | 63.83 |
| 15/11/2021 | 63.2 | 64.46 | 63.83 |
| 16/11/2021 | 63.2 | 64.46 | 63.83 |
| 17/11/2021 | 63.2 | 64.46 | 63.83 |
| 18/11/2021 | 63.2 | 64.46 | 63.83 |
| 19/11/2021 | 63.2 | 64.46 | 63.83 |
| 22/11/2021 | 63.2 | 64.46 | 63.83 |
| 23/11/2021 | 63.2 | 64.46 | 63.83 |
| 24/11/2021 | 63.2 | 64.46 | 63.83 |
| 25/11/2021 | 63.2 | 64.46 | 63.83 |
| 26/11/2021 | 63.2 | 64.46 | 63.83 |
| 29/11/2021 | 63.2 | 64.46 | 63.83 |
| 30/11/2021 | 63.2 | 64.46 | 63.83 |
| 01/12/2021 | 63.2 | 64.46 | 63.83 |
| 02/12/2021 | 63.2 | 64.46 | 63.83 |
| 03/12/2021 | 63.2 | 64.46 | 63.83 |
| 06/12/2021 | 63.2 | 64.46 | 63.83 |
| 07/12/2021 | 63.2 | 64.46 | 63.83 |
| 08/12/2021 | 63.2 | 64.46 | 63.83 |
| 09/12/2021 | 63.2 | 64.46 | 63.83 |
| 10/12/2021 | 63.2 | 64.46 | 63.83 |
| 13/12/2021 | 63.2 | 64.46 | 63.83 |
| 14/12/2021 | 63.2 | 64.46 | 63.83 |
| 15/12/2021 | 63.2 | 64.46 | 63.83 |
| 16/12/2021 | 63.2 | 64.46 | 63.83 |
| 17/12/2021 | 63.2 | 64.46 | 63.83 |
| 20/12/2021 | 63.2 | 64.46 | 63.83 |
| 21/12/2021 | 63.2 | 64.46 | 63.83 |
| 22/12/2021 | 63.2 | 64.46 | 63.83 |
| 23/12/2021 | 63.2 | 64.46 | 63.83 |
| 27/12/2021 | 63.2 | 64.45 | 63.83 |
| 28/12/2021 | 63.2 | 64.46 | 63.83 |
| 29/12/2021 | 63.2 | 64.46 | 63.83 |
| 30/12/2021 | 63.2 | 64.46 | 63.83 |
| 31/12/2021 | 63.2 | 64.46 | 63.83 |
| 03/01/2022 | 63.2 | 64.46 | 63.83 |
| 04/01/2022 | 63.2 | 64.46 | 63.83 |
| 05/01/2022 | 63.2 | 64.46 | 63.83 |
| 06/01/2022 | 63.2 | 64.46 | 63.83 |
| 07/01/2022 | 63.2 | 64.46 | 63.83 |
| 10/01/2022 | 63.2 | 64.46 | 63.83 |
| 11/01/2022 | 63.2 | 64.46 | 63.83 |
| 12/01/2022 | 63.2 | 64.46 | 63.83 |
| 13/01/2022 | 63.2 | 64.46 | 63.83 |
| 14/01/2022 | 63.2 | 64.46 | 63.83 |
| 17/01/2022 | 63.2 | 64.46 | 63.83 |
| 18/01/2022 | 63.2 | 64.46 | 63.83 |
| 19/01/2022 | 63.2 | 64.46 | 63.83 |
| 20/01/2022 | 63.2 | 64.46 | 63.83 |
| 21/01/2022 | 63.2 | 64.46 | 63.83 |
| 24/01/2022 | 63.2 | 64.46 | 63.83 |
| 25/01/2022 | 63.2 | 64.46 | 63.83 |
| 26/01/2022 | 63.2 | 64.46 | 63.83 |
| 27/01/2022 | 63.2 | 64.46 | 63.83 |
| 28/01/2022 | 63.2 | 64.46 | 63.83 |
| 31/01/2022 | 63.2 | 64.46 | 63.83 |
| 01/02/2022 | 63.2 | 64.46 | 63.83 |
| 02/02/2022 | 63.2 | 64.46 | 63.83 |
| 04/02/2022 | 63.2 | 64.46 | 63.83 |
| 07/02/2022 | 63.2 | 64.46 | 63.83 |
| 08/02/2022 | 63.2 | 64.46 | 63.83 |
| 09/02/2022 | 63.2 | 64.46 | 63.83 |
| 10/02/2022 | 63.2 | 64.46 | 63.83 |
| 11/02/2022 | 63.2 | 64.46 | 63.83 |
| 14/02/2022 | 63.2 | 64.46 | 63.83 |
| 15/02/2022 | 63.2 | 64.46 | 63.83 |
| 16/02/2022 | 63.2 | 64.46 | 63.83 |
| 17/02/2022 | 63.2 | 64.46 | 63.83 |
| 18/02/2022 | 63.2 | 64.46 | 63.83 |
| 21/02/2022 | 63.2 | 64.46 | 63.83 |
| 22/02/2022 | 63.2 | 64.46 | 63.83 |
| 23/02/2022 | 63.2 | 64.46 | 63.83 |
| 24/02/2022 | 63.2 | 64.46 | 63.83 |
| 25/02/2022 | 63.2 | 64.46 | 63.83 |
| 28/02/2022 | 63.2 | 64.46 | 63.83 |
| 01/03/2022 | 63.2 | 64.46 | 63.83 |
| 02/03/2022 | 63.2 | 64.46 | 63.83 |
| 03/03/2022 | 63.2 | 64.46 | 63.83 |
| 04/03/2022 | 63.2 | 64.46 | 63.83 |
| 07/03/2022 | 63.2 | 64.46 | 63.83 |
| 08/03/2022 | 63.2 | 64.46 | 63.83 |
| 09/03/2022 | 63.2 | 64.46 | 63.83 |
| 10/03/2022 | 63.2 | 64.46 | 63.83 |
| 11/03/2022 | 63.2 | 64.46 | 63.83 |
| 14/03/2022 | 63.2 | 64.46 | 63.83 |
| 15/03/2022 | 63.2 | 64.46 | 63.83 |
| 16/03/2022 | 63.2 | 64.46 | 63.83 |
| 17/03/2022 | 63.2 | 64.46 | 63.83 |
| 18/03/2022 | 63.2 | 64.46 | 63.83 |
| 21/03/2022 | 63.2 | 64.46 | 63.83 |
| 22/03/2022 | 63.2 | 64.46 | 63.83 |
| 23/03/2022 | 63.2 | 64.46 | 63.83 |
| 24/03/2022 | 63.2 | 64.46 | 63.83 |
| 25/03/2022 | 63.2 | 64.46 | 63.83 |
| 28/03/2022 | 63.2 | 64.46 | 63.83 |
| 29/03/2022 | 63.2 | 64.46 | 63.83 |
| 30/03/2022 | 63.2 | 64.46 | 63.83 |
| 31/03/2022 | 63.2 | 64.46 | 63.83 |
| 01/04/2022 | 63.2 | 64.46 | 63.83 |
| 04/04/2022 | 63.2 | 64.46 | 63.83 |
| 05/04/2022 | 63.2 | 64.46 | 63.83 |
| 06/04/2022 | 63.2 | 64.46 | 63.83 |
| 08/04/2022 | 63.2 | 64.46 | 63.83 |
| 11/04/2022 | 63.2 | 64.46 | 63.83 |
| 12/04/2022 | 63.2 | 64.46 | 63.83 |
| 13/04/2022 | 63.2 | 64.46 | 63.83 |
| 14/04/2022 | 63.2 | 64.46 | 63.83 |
| 18/04/2022 | 63.2 | 64.46 | 63.83 |
| 19/04/2022 | 63.2 | 64.46 | 63.83 |
| 20/04/2022 | 63.2 | 64.46 | 63.83 |
| 21/04/2022 | 63.2 | 64.46 | 63.83 |
| 22/04/2022 | 63.2 | 64.46 | 63.83 |
| 25/04/2020 | 63.2 | 64.46 | 63.83 |
| 26/04/2022 | 63.2 | 64.46 | 63.83 |
| 27/04/2022 | 63.2 | 64.46 | 63.83 |
| 28/04/2022 | 63.2 | 64.46 | 63.83 |
| 29/04/2022 | 63.2 | 64.46 | 63.83 |
| 03/05/2022 | 63.2 | 64.46 | 63.83 |
| 04/05/2022 | 63.2 | 64.46 | 63.83 |
| 05/05/2022 | 63.2 | 64.46 | 63.83 |
| 06/05/2022 | 63.2 | 64.46 | 63.83 |
| 09/05/2022 | 63.2 | 64.46 | 63.83 |
| 10/05/2022 | 63.2 | 64.46 | 63.83 |
| 11/05/2022 | 63.2 | 64.46 | 63.83 |
| 12/05/2022 | 63.2 | 64.46 | 63.83 |
| 13/05/2022 | 63.2 | 64.46 | 63.83 |
| 16/05/2022 | 63.2 | 64.46 | 63.83 |
| 17/05/2022 | 63.2 | 64.46 | 63.83 |
| 18/05/2022 | 63.2 | 64.46 | 63.83 |
| 19/05/2022 | 63.2 | 64.46 | 63.83 |
| 20/05/2022 | 63.2 | 64.46 | 63.83 |
| 23/05/2022 | 63.2 | 64.46 | 63.83 |
| 24/05/2022 | 63.2 | 64.46 | 63.83 |
| 25/05/2022 | 63.21 | 64.47 | 63.84 |
| 26/05/2022 | 63.21 | 64.47 | 63.84 |
| 27/05/2022 | 63.21 | 64.47 | 63.84 |
| 30/05/2022 | 63.21 | 64.47 | 63.84 |
| 31/05/2022 | 63.21 | 64.47 | 63.84 |
| 01/06/2022 | 63.21 | 64.47 | 63.84 |
| 02/06/2022 | 63.21 | 64.47 | 63.84 |
| 03/06/2022 | 63.21 | 64.47 | 63.84 |
| 06/06/2022 | 63.21 | 64.48 | 63.85 |
| 07/06/2022 | 63.21 | 64.48 | 63.85 |
| 08/06/2022 | 63.21 | 64.48 | 63.85 |
| 09/06/2022 | 63.21 | 64.48 | 63.85 |
| 10/06/2022 | 63.21 | 64.48 | 63.85 |
| 13/06/2022 | 63.21 | 64.48 | 63.85 |
| 14/06/2022 | 63.21 | 64.48 | 63.85 |
| 15/06/2022 | 63.21 | 64.48 | 63.85 |
| 16/06/2022 | 63.21 | 64.48 | 63.85 |
| 17/06/2022 | 63.21 | 64.48 | 63.85 |
| 20/06/2022 | 63.22 | 64.48 | 63.85 |
| 21/06/2022 | 63.23 | 64.49 | 63.86 |
| 22/06/2022 | 63.23 | 64.49 | 63.86 |
| 23/06/2022 | 63.23 | 64.49 | 63.86 |
| 24/06/2022 | 63.23 | 64.49 | 63.86 |
| 27/06/2022 | 63.23 | 64.49 | 63.86 |
| 28/06/2022 | 63.23 | 64.49 | 63.86 |
| 29/06/2022 | 63.23 | 64.49 | 63.86 |
| 30/06/2022 | 63.23 | 64.49 | 63.86 |
| 01/07/2022 | 63.23 | 64.49 | 63.86 |
| 04/07/2022 | 63.23 | 64.49 | 63.86 |
| 05/07/2022 | 63.23 | 64.49 | 63.86 |
| 06/07/2022 | 63.23 | 64.49 | 63.86 |
| 07/07/2022 | 63.23 | 64.49 | 63.86 |
| 08/07/2022 | 63.23 | 64.49 | 63.86 |
| 11/07/2022 | 63.23 | 64.49 | 63.86 |
| 12/07/2022 | 63.23 | 64.49 | 63.86 |
| 13/07/2022 | 63.23 | 64.49 | 63.86 |
| 14/07/2022 | 63.23 | 64.49 | 63.86 |
| 15/07/2022 | 63.23 | 64.49 | 63.86 |
| 18/07/2022 | 63.23 | 64.49 | 63.86 |
| 19/07/2022 | 63.23 | 64.49 | 63.86 |
| 20/07/2022 | 63.23 | 64.49 | 63.86 |
| 21/07/2022 | 63.23 | 64.49 | 63.86 |
| 22/07/2022 | 63.23 | 64.49 | 63.86 |
| 25/07/2022 | 63.23 | 64.5 | 63.87 |
| 26/07/2022 | 63.23 | 64.5 | 63.87 |
| 27/07/2022 | 63.23 | 64.5 | 63.87 |
| 28/07/2022 | 63.23 | 64.5 | 63.87 |
| 29/07/2022 | 63.23 | 64.5 | 63.87 |
| 01/08/2022 | 63.23 | 64.5 | 63.87 |
| 02/08/2022 | 63.24 | 64.5 | 63.87 |
| 03/08/2022 | 63.24 | 64.5 | 63.87 |
| 04/08/2022 | 63.24 | 64.5 | 63.87 |
| 05/08/2022 | 63.24 | 64.5 | 63.87 |
| 08/08/2022 | 63.24 | 64.5 | 63.87 |
| 09/08/2022 | 63.24 | 64.5 | 63.87 |
| 10/08/2022 | 63.24 | 64.5 | 63.87 |
| 11/08/2022 | 63.24 | 64.5 | 63.87 |
| 12/08/2022 | 63.24 | 64.5 | 63.87 |
| 15/08/2022 | 63.24 | 64.5 | 63.87 |
| 16/08/2022 | 63.24 | 64.5 | 63.87 |
| 17/08/2022 | 63.24 | 64.5 | 63.87 |
| 18/08/2022 | 63.24 | 64.5 | 63.87 |
| 19/08/2022 | 63.24 | 64.5 | 63.87 |
| 22/08/2022 | 63.24 | 64.5 | 63.87 |
| 23/08/2022 | 63.24 | 64.5 | 63.87 |
| 24/08/2022 | 63.24 | 64.5 | 63.87 |
| 25/08/2022 | 63.24 | 64.5 | 63.87 |
| 26/08/2022 | 63.24 | 64.5 | 63.87 |
| 29/08/2022 | 63.24 | 64.5 | 63.87 |
| 30/08/2022 | 63.24 | 64.5 | 63.87 |
| 31/08/2022 | 63.24 | 64.5 | 63.87 |
| 01/09/2022 | 63.24 | 64.5 | 63.87 |
| 02/09/2022 | 63.24 | 64.5 | 63.87 |
| 05/09/2022 | 63.24 | 64.5 | 63.87 |
| 06/09/2022 | 63.24 | 64.5 | 63.87 |
| 08/09/2022 | 63.24 | 64.5 | 63.87 |
| 09/09/2022 | 63.24 | 64.5 | 63.87 |
| 12/09/2022 | 63.24 | 64.5 | 63.87 |
| 13/09/2022 | 63.24 | 64.5 | 63.87 |
| 14/09/2022 | 63.24 | 64.5 | 63.87 |
| 15/09/2022 | 63.24 | 64.5 | 63.87 |
| 16/09/2022 | 63.24 | 64.5 | 63.87 |
| 19/09/2022 | 63.24 | 64.5 | 63.87 |
| 20/09/2022 | 63.24 | 64.5 | 63.87 |
| 21/09/2022 | 63.24 | 64.5 | 63.87 |
| 22/09/2022 | 63.24 | 64.5 | 63.87 |
| 23/09/2022 | 63.24 | 64.5 | 63.87 |
| 27/09/2022 | 63.24 | 64.5 | 63.87 |
| 28/09/2022 | 63.24 | 64.5 | 63.87 |
| 29/09/2022 | 63.24 | 64.5 | 63.87 |
| 30/09/2022 | 63.24 | 64.5 | 63.87 |
| 03/10/2022 | 63.24 | 64.5 | 63.87 |
| 05/10/2022 | 63.24 | 64.5 | 63.87 |
| 06/10/2022 | 63.24 | 64.5 | 63.87 |
| 07/10/2022 | 63.24 | 64.5 | 63.87 |
| 10/10/2022 | 63.24 | 64.5 | 63.87 |
| 11/10/2022 | 63.24 | 64.5 | 63.87 |
| 12/10/2022 | 63.24 | 64.5 | 63.87 |
| 13/10/2022 | 63.24 | 64.5 | 63.87 |
| 14/10/2022 | 63.24 | 64.5 | 63.87 |
| 17/10/2022 | 63.24 | 64.5 | 63.87 |
| 18/10/2022 | 63.24 | 64.5 | 63.87 |
| 19/10/2022 | 63.24 | 64.5 | 63.87 |
| 20/10/2022 | 63.24 | 64.5 | 63.87 |
| 21/10/2022 | 63.24 | 64.5 | 63.87 |
| 24/10/2022 | 63.24 | 64.5 | 63.87 |
| 25/10/2022 | 63.24 | 64.5 | 63.87 |
| 26/10/2022 | 63.24 | 64.5 | 63.87 |
| 27/10/2022 | 63.24 | 64.5 | 63.87 |
| 28/10/2022 | 63.24 | 64.5 | 63.87 |
| 31/10/2022 | 63.24 | 64.5 | 63.87 |
| 01/11/2022 | 63.24 | 64.5 | 63.87 |
| 02/11/2022 | 63.24 | 64.5 | 63.87 |
| 03/11/2022 | 63.24 | 64.5 | 63.87 |
| 04/11/2022 | 63.24 | 64.5 | 63.87 |
| 07/11/2022 | 63.24 | 64.5 | 63.87 |
| 08/11/2022 | 63.24 | 64.5 | 63.87 |
| 09/11/2022 | 63.24 | 64.5 | 63.87 |
| 11/11/2022 | 63.24 | 64.5 | 63.87 |
| 14/11/2022 | 63.24 | 64.5 | 63.87 |
| 15/11/2022 | 63.24 | 64.5 | 63.87 |
| 16/11/2022 | 63.24 | 64.5 | 63.87 |
| 17/11/2022 | 63.24 | 64.5 | 63.87 |
| 18/11/2022 | 63.24 | 64.5 | 63.87 |
| 21/11/2022 | 63.24 | 64.5 | 63.87 |
| 22/11/2022 | 63.24 | 64.5 | 63.87 |
| 23/11/2022 | 63.24 | 64.5 | 63.87 |
| 24/11/2022 | 63.24 | 64.5 | 63.87 |
| 25/11/2022 | 63.24 | 64.5 | 63.87 |
| 28/11/2022 | 63.24 | 64.5 | 63.87 |
| 29/11/2022 | 63.24 | 64.5 | 63.87 |
| 30/11/2022 | 63.24 | 64.5 | 63.87 |
| 01/12/2022 | 63.24 | 64.5 | 63.87 |
| 02/12/2022 | 63.24 | 64.5 | 63.87 |
| 05/12/2022 | 63.24 | 64.5 | 63.87 |
| 06/12/2022 | 63.24 | 64.5 | 63.87 |
| 07/12/2022 | 63.24 | 64.5 | 63.87 |
| 08/12/2022 | 63.24 | 64.5 | 63.87 |
| 09/12/2022 | 63.24 | 64.5 | 63.87 |
| 12/12/2022 | 63.24 | 64.5 | 63.87 |
| 13/12/2022 | 63.24 | 64.5 | 63.87 |
| 14/12/2022 | 63.24 | 64.5 | 63.87 |
| 15/12/2022 | 63.24 | 64.5 | 63.87 |
| 16/12/2022 | 63.24 | 64.5 | 63.87 |
| 19/12/2022 | 63.24 | 64.5 | 63.87 |
| 20/12/2022 | 63.24 | 64.5 | 63.87 |
| 21/12/2022 | 63.24 | 64.5 | 63.87 |
| 22/12/2022 | 63.24 | 64.5 | 63.87 |
| 23/12/2022 | 63.24 | 64.5 | 63.87 |
| 27/12/2022 | 63.24 | 64.5 | 63.87 |
| 28/12/2022 | 63.24 | 64.5 | 63.87 |
| 29/12/2022 | 63.24 | 64.5 | 63.87 |
| 30/12/2022 | 63.24 | 64.5 | 63.87 |
| 03/01/2023 | 63.24 | 64.5 | 63.87 |
| 04/01/2023 | 63.24 | 64.51 | 63.88 |
| 05/01/2023 | 63.24 | 64.51 | 63.88 |
| 06/01/2023 | 63.24 | 64.51 | 63.88 |
| 09/01/2023 | 63.24 | 64.51 | 63.88 |
| 10/01/2023 | 63.24 | 64.51 | 63.88 |
| 11/01/2023 | 63.24 | 64.51 | 63.88 |
| 12/01/2023 | 63.24 | 64.51 | 63.88 |
| 13/01/2023 | 63.24 | 64.51 | 63.88 |
| 16/01/2023 | 63.24 | 64.51 | 63.88 |
| 17/01/2023 | 63.24 | 64.51 | 63.88 |
| 18/01/2023 | 63.24 | 64.51 | 63.88 |
| 19/01/2023 | 63.24 | 64.51 | 63.88 |
| 20/01/2023 | 63.24 | 64.51 | 63.88 |
| 23/01/2023 | 63.24 | 64.51 | 63.88 |
| 24/01/2023 | 63.24 | 64.51 | 63.88 |
| 25/01/2023 | 63.24 | 64.51 | 63.88 |
| 26/01/2023 | 63.24 | 64.51 | 63.88 |
| 27/01/2023 | 63.24 | 64.51 | 63.88 |
| 30/01/2023 | 63.24 | 64.51 | 63.88 |
| 31/01/2023 | 63.24 | 64.51 | 63.88 |
| 01/02/2023 | 63.24 | 64.51 | 63.88 |
| 02/02/2023 | 63.24 | 64.5 | 63.87 |
| 06/02/2023 | 63.24 | 64.5 | 63.87 |
| 07/02/2023 | 63.25 | 64.51 | 63.88 |
| 08/02/2023 | 63.25 | 64.51 | 63.88 |
| 09/02/2023 | 63.25 | 64.51 | 63.88 |
| 10/02/2023 | 63.25 | 64.51 | 63.88 |
| 13/02/2023 | 63.25 | 64.51 | 63.88 |
| 14/02/2023 | 63.25 | 64.51 | 63.88 |
| 15/02/2023 | 63.25 | 64.51 | 63.88 |
| 16/02/2023 | 63.25 | 64.51 | 63.88 |
| 17/02/2023 | 63.25 | 64.51 | 63.88 |
| 20/02/2023 | 63.25 | 64.51 | 63.88 |
| 21/02/2023 | 63.25 | 64.51 | 63.88 |
| 22/02/2023 | 63.25 | 64.51 | 63.88 |
| 23/02/2023 | 63.25 | 64.51 | 63.88 |
| 24/02/2023 | 63.25 | 64.51 | 63.88 |
| 27/02/2023 | 63.25 | 64.51 | 63.88 |
| 28/02/2023 | 63.25 | 64.51 | 63.88 |
| 01/03/2023 | 63.25 | 64.51 | 63.88 |
| 02/03/2023 | 63.25 | 64.52 | 63.89 |
| 03/03/2023 | 63.25 | 64.51 | 63.88 |
| 06/03/2023 | 63.25 | 64.51 | 63.88 |
| 07/03/2023 | 63.25 | 64.51 | 63.88 |
| 08/03/2023 | 63.25 | 64.51 | 63.88 |
| 09/03/2023 | 63.25 | 64.51 | 63.88 |
| 10/03/2023 | 63.25 | 64.51 | 63.88 |
| 13/03/2023 | 63.25 | 64.51 | 63.88 |
| 14/03/2023 | 63.25 | 64.51 | 63.88 |
| 15/03/2023 | 63.25 | 64.51 | 63.88 |
| 16/03/2023 | 63.25 | 64.51 | 63.88 |
| 17/03/2023 | 63.25 | 64.51 | 63.88 |
| 20/03/2023 | 63.25 | 64.51 | 63.88 |
| 21/03/2023 | 63.25 | 64.51 | 63.88 |
| 22/03/2023 | 63.25 | 64.51 | 63.88 |
| 23/03/2023 | 63.25 | 64.51 | 63.88 |
| 24/03/2023 | 63.25 | 64.51 | 63.88 |
| 27/03/2023 | 63.25 | 64.51 | 63.88 |
| 28/03/2023 | 63.25 | 64.51 | 63.88 |
| 29/03/2023 | 63.25 | 64.51 | 63.88 |
| 30/03/2023 | 63.25 | 64.51 | 63.88 |
| 31/03/2023 | 63.25 | 64.51 | 63.88 |
| 03/04/2023 | 63.25 | 64.51 | 63.88 |
| 04/04/2023 | 63.25 | 64.51 | 63.88 |
| 05/04/2023 | 63.25 | 64.51 | 63.88 |
| 06/04/2023 | 63.25 | 64.51 | 63.88 |
| 10/04/2023 | 63.25 | 64.51 | 63.88 |
| 11/04/2023 | 63.25 | 64.51 | 63.88 |
| 12/04/2023 | 63.25 | 64.51 | 63.88 |
| 13/04/2023 | 63.25 | 64.51 | 63.88 |
| 14/04/2023 | 63.25 | 64.51 | 63.88 |
| 17/04/2023 | 63.25 | 64.51 | 63.88 |
| 18/04/2023 | 63.25 | 64.51 | 63.88 |
| 19/04/2023 | 63.25 | 64.51 | 63.88 |
| 20/04/2023 | 63.25 | 64.51 | 63.88 |
| 21/04/2023 | 63.25 | 64.51 | 63.88 |
| 24/04/2023 | 63.25 | 64.51 | 63.88 |
| 25/04/2023 | 63.25 | 64.51 | 63.88 |
| 26/04/2023 | 63.25 | 64.51 | 63.88 |
| 27/04/2023 | 63.25 | 64.51 | 63.88 |
| 28/04/2023 | 63.25 | 64.51 | 63.88 |
| 02/05/2023 | 63.25 | 64.51 | 63.88 |
| 03/05/2023 | 63.25 | 64.51 | 63.88 |
| 04/05/2023 | 63.25 | 64.51 | 63.88 |
| 05/05/2023 | 63.25 | 64.51 | 63.88 |
| 08/05/2023 | 63.25 | 64.51 | 63.88 |
| 09/05/2023 | 63.25 | 64.51 | 63.88 |
| 10/05/2023 | 63.25 | 64.51 | 63.88 |
| 11/05/2023 | 63.25 | 64.51 | 63.88 |
| 12/05/2023 | 63.25 | 64.51 | 63.88 |
| 15/05/2023 | 63.25 | 64.51 | 63.88 |
| 16/05/2023 | 63.25 | 64.51 | 63.88 |
| 17/05/2023 | 63.25 | 64.51 | 63.88 |
| 18/05/2023 | 63.25 | 64.51 | 63.88 |
| 19/05/2023 | 63.25 | 64.52 | 63.89 |
| 22/05/2023 | 63.25 | 64.52 | 63.89 |
| 23/05/2023 | 63.25 | 64.52 | 63.89 |
| 24/05/2023 | 63.25 | 64.52 | 63.89 |
| 25/05/2023 | 63.25 | 64.52 | 63.89 |
| 26/05/2023 | 63.25 | 64.52 | 63.89 |
| 29/05/2023 | 63.25 | 64.52 | 63.89 |
| 30/05/2023 | 63.25 | 64.52 | 63.89 |
| 31/05/2023 | 63.25 | 64.52 | 63.89 |
| 01/06/2023 | 63.25 | 64.52 | 63.89 |
| 02/06/2023 | 63.25 | 64.51 | 63.88 |
| 05/06/2023 | 63.25 | 64.51 | 63.88 |
| 06/06/2023 | 63.25 | 64.51 | 63.88 |
| 07/06/2023 | 63.25 | 64.52 | 63.89 |
| 08/06/2023 | 63.25 | 64.51 | 63.88 |
| 09/06/2023 | 63.25 | 64.51 | 63.88 |
| 12/06/2023 | 63.25 | 64.51 | 63.88 |
| 13/06/2023 | 63.25 | 64.51 | 63.88 |
| 14/06/2023 | 63.25 | 64.51 | 63.88 |
| 15/06/2023 | 63.25 | 64.51 | 63.88 |
| 16/06/2023 | 63.25 | 64.51 | 63.88 |
| 19/06/2023 | 63.25 | 64.51 | 63.88 |
| 20/06/2023 | 63.25 | 64.51 | 63.88 |
| 21/06/2023 | 63.25 | 64.51 | 63.88 |
| 22/06/2023 | 63.25 | 64.51 | 63.88 |
| 23/06/2023 | 63.25 | 64.51 | 63.88 |
| 27/06/2023 | 63.25 | 64.51 | 63.88 |
| 28/06/2023 | 63.25 | 64.51 | 63.88 |
| 29/06/2023 | 63.25 | 64.51 | 63.88 |
| 30/06/2023 | 63.25 | 64.51 | 63.88 |
| 03/07/2023 | 63.25 | 64.51 | 63.88 |
| 04/07/2023 | 63.25 | 64.52 | 63.89 |
| 05/07/2023 | 63.25 | 64.52 | 63.89 |
| 06/07/2023 | 63.25 | 64.52 | 63.89 |
| 07/07/2023 | 63.25 | 64.52 | 63.89 |
| 10/07/2023 | 63.25 | 64.52 | 63.89 |
| 11/07/2023 | 63.25 | 64.52 | 63.89 |
| 12/07/2023 | 63.25 | 64.52 | 63.89 |
| 13/07/2023 | 63.25 | 64.52 | 63.89 |
| 14/07/2023 | 63.25 | 64.52 | 63.89 |
| 17/07/2023 | 63.25 | 64.52 | 63.89 |
| 18/07/2023 | 63.25 | 64.52 | 63.89 |
| 19/07/2023 | 63.25 | 64.52 | 63.89 |
| 20/07/2023 | 63.25 | 64.52 | 63.89 |
| 21/07/2023 | 63.25 | 64.52 | 63.89 |
| 24/07/2023 | 63.25 | 64.52 | 63.89 |
| 25/07/2023 | 63.25 | 64.52 | 63.89 |
| 26/07/2023 | 63.25 | 64.52 | 63.89 |
| 27/07/2023 | 63.25 | 64.52 | 63.89 |
| 28/07/2023 | 63.25 | 64.52 | 63.89 |
| 31/07/2023 | 63.25 | 64.52 | 63.89 |
| 01/08/2023 | 63.25 | 64.52 | 63.89 |
| 02/08/2023 | 63.25 | 64.52 | 63.89 |
| 03/08/2023 | 63.25 | 64.52 | 63.89 |
| 04/08/2023 | 63.25 | 64.52 | 63.89 |
| 07/08/2023 | 63.25 | 64.52 | 63.89 |
| 08/08/2023 | 63.25 | 64.52 | 63.89 |
| 09/08/2023 | 63.25 | 64.52 | 63.89 |
| 10/08/2023 | 63.25 | 64.52 | 63.89 |
| 11/08/2023 | 63.25 | 64.52 | 63.89 |
| 14/08/2023 | 63.25 | 64.52 | 63.89 |
| 15/08/2023 | 63.25 | 64.52 | 63.89 |
| 16/08/2023 | 63.25 | 64.52 | 63.89 |
| 17/08/2023 | 63.25 | 64.52 | 63.89 |
| 18/08/2023 | 63.25 | 64.52 | 63.89 |
| 21/08/2023 | 63.25 | 64.52 | 63.89 |
| 22/08/2023 | 63.25 | 64.52 | 63.89 |
| 23/08/2023 | 63.25 | 64.52 | 63.89 |
| 24/08/2023 | 63.25 | 64.52 | 63.89 |
| 25/08/2023 | 63.25 | 64.52 | 63.89 |
| 28/08/2023 | 63.25 | 64.52 | 63.89 |
| 29/08/2023 | 63.25 | 64.52 | 63.89 |
| 30/08/2023 | 63.25 | 64.52 | 63.89 |
| 31/08/2023 | 63.25 | 64.52 | 63.89 |
| 01/09/2023 | 63.25 | 64.52 | 63.89 |
| 04/09/2023 | 63.25 | 64.52 | 63.89 |
| 05/09/2023 | 63.25 | 64.52 | 63.89 |
| 06/09/2023 | 63.25 | 64.52 | 63.89 |
| 08/09/2023 | 63.25 | 64.52 | 63.89 |
| 11/09/2023 | 63.25 | 64.52 | 63.89 |
| 12/09/2023 | 63.25 | 64.52 | 63.89 |
| 13/09/2023 | 63.25 | 64.52 | 63.89 |
| 14/09/2023 | 63.25 | 64.52 | 63.89 |
| 15/09/2023 | 63.25 | 64.52 | 63.89 |
| 18/09/2023 | 63.25 | 64.52 | 63.89 |
| 19/09/2023 | 63.25 | 64.52 | 63.89 |
| 20/09/2023 | 63.25 | 64.52 | 63.89 |
| 21/09/2023 | 63.25 | 64.52 | 63.89 |
| 22/09/2023 | 63.25 | 64.52 | 63.89 |
| 26/09/2023 | 63.25 | 64.52 | 63.89 |
| 27/09/2023 | 63.25 | 64.52 | 63.89 |
| 28/09/2023 | 63.25 | 64.52 | 63.89 |
| 29/09/2023 | 63.25 | 64.52 | 63.89 |
| 02/10/2023 | 63.25 | 64.52 | 63.89 |
| 03/10/2023 | 63.25 | 64.52 | 63.89 |
| 05/10/2023 | 63.25 | 64.52 | 63.89 |
| 06/10/2023 | 63.25 | 64.52 | 63.89 |
| 09/10/2023 | 63.25 | 64.52 | 63.89 |
| 10/10/2023 | 63.26 | 64.52 | 63.89 |
| 12/10/2023 | 63.26 | 64.52 | 63.89 |
| 13/10/2023 | 63.26 | 64.52 | 63.89 |
| 16/10/2023 | 63.26 | 64.52 | 63.89 |
| 17/10/2023 | 63.26 | 64.52 | 63.89 |
| 18/10/2023 | 63.26 | 64.52 | 63.89 |
| 19/10/2023 | 63.26 | 64.52 | 63.89 |
| 20/10/2023 | 63.26 | 64.52 | 63.89 |
| 23/10/2023 | 63.26 | 64.52 | 63.89 |
| 24/10/2023 | 63.26 | 64.52 | 63.89 |
| 25/10/2023 | 63.26 | 64.52 | 63.89 |
| 26/10/2023 | 63.26 | 64.52 | 63.89 |
| 27/10/2023 | 63.26 | 64.52 | 63.89 |
| 30/10/2023 | 63.26 | 64.52 | 63.89 |
| 31/10/2023 | 63.26 | 64.52 | 63.89 |
| 01/11/2023 | 63.26 | 64.52 | 63.89 |
| 02/11/2023 | 63.25 | 64.52 | 63.89 |
| 03/11/2023 | 63.26 | 64.52 | 63.89 |
| 06/11/2023 | 63.25 | 64.52 | 63.89 |
| 07/11/2023 | 63.26 | 64.52 | 63.89 |
| 08/11/2023 | 63.26 | 64.52 | 63.89 |
| 09/11/2023 | 63.26 | 64.52 | 63.89 |
| 13/11/2023 | 63.26 | 64.52 | 63.89 |
| 14/11/2023 | 63.26 | 64.52 | 63.89 |
| 15/11/2023 | 63.26 | 64.52 | 63.89 |
| 16/11/2023 | 63.26 | 64.52 | 63.89 |
| 17/11/2023 | 63.26 | 64.52 | 63.89 |
| 20/11/2023 | 63.26 | 64.52 | 63.89 |
| 21/11/2023 | 63.26 | 64.53 | 63.9 |
| 22/11/2023 | 63.26 | 64.53 | 63.9 |
| 23/11/2023 | 63.26 | 64.53 | 63.9 |
| 24/11/2023 | 63.26 | 64.53 | 63.9 |
| 27/11/2023 | 63.26 | 64.53 | 63.9 |
| 28/11/2023 | 63.26 | 64.53 | 63.9 |
| 29/11/2023 | 63.26 | 64.53 | 63.9 |
| 30/11/2023 | 63.26 | 64.53 | 63.9 |
| 01/12/2023 | 63.26 | 64.53 | 63.9 |
| 04/12/2023 | 63.27 | 64.53 | 63.9 |
| 05/12/2023 | 63.27 | 64.53 | 63.9 |
| 06/12/2023 | 63.27 | 64.53 | 63.9 |
| 07/12/2023 | 63.27 | 64.53 | 63.9 |
| 08/12/2023 | 63.27 | 64.53 | 63.9 |
| 11/12/2023 | 63.27 | 64.53 | 63.9 |
| 12/12/2023 | 63.27 | 64.53 | 63.9 |
| 13/12/2023 | 63.27 | 64.53 | 63.9 |
| 14/12/2023 | 63.27 | 64.53 | 63.9 |
| 15/12/2023 | 63.27 | 64.53 | 63.9 |
| 18/12/2023 | 63.27 | 64.53 | 63.9 |
| 19/12/2023 | 63.27 | 64.53 | 63.9 |
| 20/12/2023 | 63.27 | 64.53 | 63.9 |
| 21/12/2023 | 63.27 | 64.53 | 63.9 |
| 22/12/2023 | 63.27 | 64.53 | 63.9 |
| 26/12/2023 | 63.27 | 64.53 | 63.9 |
| 27/12/2023 | 63.27 | 64.53 | 63.9 |
| 28/12/2023 | 63.27 | 64.53 | 63.9 |
| 29/12/2023 | 63.27 | 64.53 | 63.9 |
| 02/01/2024 | 63.27 | 64.53 | 63.9 |
| 03/01/2024 | 63.27 | 64.53 | 63.9 |
| 04/01/2024 | 63.27 | 64.53 | 63.9 |
| 05/01/2024 | 63.27 | 64.53 | 63.9 |
| 08/01/2024 | 63.27 | 64.53 | 63.9 |
| 09/01/2024 | 63.27 | 64.53 | 63.9 |
| 10/01/2024 | 63.27 | 64.53 | 63.9 |
| 11/01/2024 | 63.27 | 64.53 | 63.9 |
| 12/01/2024 | 63.27 | 64.53 | 63.9 |
| 15/01/2024 | 63.27 | 64.53 | 63.9 |
| 16/01/2024 | 63.27 | 64.53 | 63.9 |
| 17/01/2024 | 63.27 | 64.53 | 63.9 |
| 18/01/2024 | 63.27 | 64.53 | 63.9 |
| 19/01/2024 | 63.27 | 64.53 | 63.9 |
| 22/01/2024 | 63.27 | 64.53 | 63.9 |
| 23/01/2024 | 63.27 | 64.53 | 63.9 |
| 24/01/2024 | 63.27 | 64.53 | 63.9 |
| 25/01/2024 | 63.27 | 64.53 | 63.9 |
| 26/01/2024 | 63.27 | 64.53 | 63.9 |
| 29/01/2024 | 63.27 | 64.53 | 63.9 |
| 30/01/2024 | 63.27 | 64.53 | 63.9 |
| 31/01/2024 | 63.27 | 64.53 | 63.9 |
| 01/02/2024 | 63.27 | 64.53 | 63.9 |
| 02/02/2024 | 63.27 | 64.53 | 63.9 |
| 05/02/2024 | 63.27 | 64.53 | 63.9 |
| 06/02/2024 | 63.27 | 64.53 | 63.9 |
| 07/02/2024 | 63.27 | 64.53 | 63.9 |
| 08/02/2024 | 63.27 | 64.53 | 63.9 |
| 09/02/2024 | 63.27 | 64.53 | 63.9 |
| 12/02/2024 | 63.27 | 64.53 | 63.9 |
| 13/02/2024 | 63.27 | 64.53 | 63.9 |
| 14/02/2024 | 63.27 | 64.53 | 63.9 |
| 15/02/2024 | 63.27 | 64.53 | 63.9 |
| 16/02/2024 | 63.27 | 64.53 | 63.9 |
| 19/02/2024 | 63.27 | 64.53 | 63.9 |
| 20/02/2024 | 63.27 | 64.53 | 63.9 |
| 21/02/2024 | 63.27 | 64.53 | 63.9 |
| 22/02/2024 | 63.27 | 64.53 | 63.9 |
| 23/02/2024 | 63.27 | 64.53 | 63.9 |
| 26/02/2024 | 63.27 | 64.53 | 63.9 |
| 27/02/2024 | 63.27 | 64.53 | 63.9 |
| 28/02/2024 | 63.27 | 64.53 | 63.9 |
| 29/02/2024 | 63.27 | 64.53 | 63.9 |
| 01/03/2024 | 63.27 | 64.53 | 63.9 |
| 04/03/2024 | 63.27 | 64.53 | 63.9 |
| 05/03/2024 | 63.27 | 64.53 | 63.9 |
| 06/03/2024 | 63.27 | 64.53 | 63.9 |
| 07/03/2024 | 63.27 | 64.53 | 63.9 |
| 08/03/2024 | 63.27 | 64.53 | 63.9 |
| 11/03/2024 | 63.27 | 64.53 | 63.9 |
| 12/03/2024 | 63.27 | 64.53 | 63.9 |
| 13/03/2024 | 63.27 | 64.53 | 63.9 |
| 14/03/2024 | 63.27 | 64.53 | 63.9 |
| 15/03/2024 | 63.27 | 64.53 | 63.9 |
| 18/03/2024 | 63.27 | 64.53 | 63.9 |
| 19/03/2024 | 63.27 | 64.53 | 63.9 |
| 20/03/2024 | 63.27 | 64.53 | 63.9 |
| 21/03/2024 | 63.27 | 64.53 | 63.9 |
| 22/03/2024 | 63.27 | 64.53 | 63.9 |
| 25/03/2024 | 63.27 | 64.53 | 63.9 |
| 26/03/2024 | 63.27 | 64.53 | 63.9 |
| 27/03/2024 | 63.27 | 64.53 | 63.9 |
| 28/03/2024 | 63.27 | 64.53 | 63.9 |
| 01/04/2024 | 63.27 | 64.53 | 63.9 |
| 02/04/2024 | 63.27 | 64.53 | 63.9 |
| 03/04/2024 | 63.27 | 64.53 | 63.9 |
| 04/04/2024 | 63.27 | 64.53 | 63.9 |
| 05/04/2024 | 63.27 | 64.53 | 63.9 |
| 09/04/2024 | 63.27 | 64.53 | 63.9 |
| 10/04/2024 | 63.27 | 64.53 | 63.9 |
| 11/04/2024 | 63.27 | 64.53 | 63.9 |
| 12/04/2024 | 63.27 | 64.53 | 63.9 |
| 15/04/2024 | 63.27 | 64.53 | 63.9 |
| 16/04/2024 | 63.27 | 64.53 | 63.9 |
| 17/04/2024 | 63.27 | 64.53 | 63.9 |
| 18/04/2024 | 63.27 | 64.53 | 63.9 |
| 19/04/2024 | 63.27 | 64.53 | 63.9 |
| 22/04/2024 | 63.27 | 64.53 | 63.9 |
| 23/04/2024 | 63.27 | 64.53 | 63.9 |
| 24/04/2024 | 63.27 | 64.53 | 63.9 |
| 25/04/2024 | 63.27 | 64.53 | 63.9 |
| 26/04/2024 | 63.27 | 64.53 | 63.9 |
| 29/04/2024 | 63.27 | 64.53 | 63.9 |
| 30/04/2024 | 63.27 | 64.53 | 63.9 |